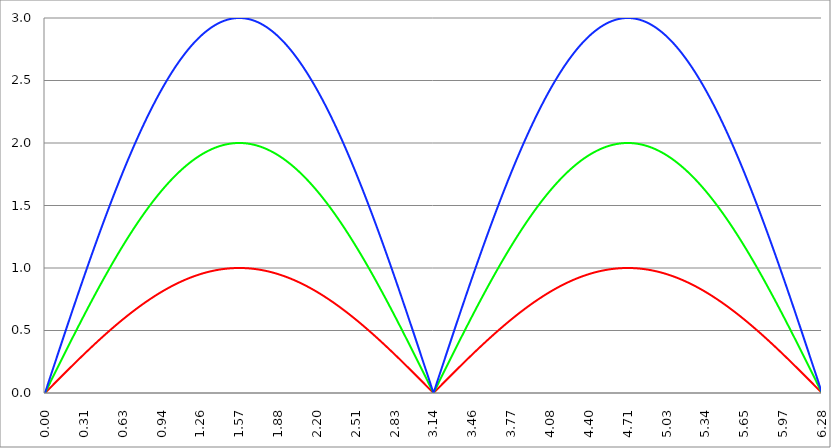
| Category | Series 1 | Series 0 | Series 2 |
|---|---|---|---|
| 0.0 | 0 | 0 | 0 |
| 0.00314159265358979 | 0.003 | 0.006 | 0.009 |
| 0.00628318530717958 | 0.006 | 0.013 | 0.019 |
| 0.00942477796076938 | 0.009 | 0.019 | 0.028 |
| 0.0125663706143592 | 0.013 | 0.025 | 0.038 |
| 0.015707963267949 | 0.016 | 0.031 | 0.047 |
| 0.0188495559215388 | 0.019 | 0.038 | 0.057 |
| 0.0219911485751285 | 0.022 | 0.044 | 0.066 |
| 0.0251327412287183 | 0.025 | 0.05 | 0.075 |
| 0.0282743338823081 | 0.028 | 0.057 | 0.085 |
| 0.0314159265358979 | 0.031 | 0.063 | 0.094 |
| 0.0345575191894877 | 0.035 | 0.069 | 0.104 |
| 0.0376991118430775 | 0.038 | 0.075 | 0.113 |
| 0.0408407044966673 | 0.041 | 0.082 | 0.122 |
| 0.0439822971502571 | 0.044 | 0.088 | 0.132 |
| 0.0471238898038469 | 0.047 | 0.094 | 0.141 |
| 0.0502654824574367 | 0.05 | 0.1 | 0.151 |
| 0.0534070751110265 | 0.053 | 0.107 | 0.16 |
| 0.0565486677646163 | 0.057 | 0.113 | 0.17 |
| 0.059690260418206 | 0.06 | 0.119 | 0.179 |
| 0.0628318530717958 | 0.063 | 0.126 | 0.188 |
| 0.0659734457253856 | 0.066 | 0.132 | 0.198 |
| 0.0691150383789754 | 0.069 | 0.138 | 0.207 |
| 0.0722566310325652 | 0.072 | 0.144 | 0.217 |
| 0.075398223686155 | 0.075 | 0.151 | 0.226 |
| 0.0785398163397448 | 0.078 | 0.157 | 0.235 |
| 0.0816814089933346 | 0.082 | 0.163 | 0.245 |
| 0.0848230016469244 | 0.085 | 0.169 | 0.254 |
| 0.0879645943005142 | 0.088 | 0.176 | 0.264 |
| 0.091106186954104 | 0.091 | 0.182 | 0.273 |
| 0.0942477796076937 | 0.094 | 0.188 | 0.282 |
| 0.0973893722612835 | 0.097 | 0.194 | 0.292 |
| 0.100530964914873 | 0.1 | 0.201 | 0.301 |
| 0.103672557568463 | 0.103 | 0.207 | 0.31 |
| 0.106814150222053 | 0.107 | 0.213 | 0.32 |
| 0.109955742875643 | 0.11 | 0.219 | 0.329 |
| 0.113097335529233 | 0.113 | 0.226 | 0.339 |
| 0.116238928182822 | 0.116 | 0.232 | 0.348 |
| 0.119380520836412 | 0.119 | 0.238 | 0.357 |
| 0.122522113490002 | 0.122 | 0.244 | 0.367 |
| 0.125663706143592 | 0.125 | 0.251 | 0.376 |
| 0.128805298797181 | 0.128 | 0.257 | 0.385 |
| 0.131946891450771 | 0.132 | 0.263 | 0.395 |
| 0.135088484104361 | 0.135 | 0.269 | 0.404 |
| 0.138230076757951 | 0.138 | 0.276 | 0.413 |
| 0.141371669411541 | 0.141 | 0.282 | 0.423 |
| 0.14451326206513 | 0.144 | 0.288 | 0.432 |
| 0.14765485471872 | 0.147 | 0.294 | 0.441 |
| 0.15079644737231 | 0.15 | 0.3 | 0.451 |
| 0.1539380400259 | 0.153 | 0.307 | 0.46 |
| 0.15707963267949 | 0.156 | 0.313 | 0.469 |
| 0.160221225333079 | 0.16 | 0.319 | 0.479 |
| 0.163362817986669 | 0.163 | 0.325 | 0.488 |
| 0.166504410640259 | 0.166 | 0.331 | 0.497 |
| 0.169646003293849 | 0.169 | 0.338 | 0.507 |
| 0.172787595947439 | 0.172 | 0.344 | 0.516 |
| 0.175929188601028 | 0.175 | 0.35 | 0.525 |
| 0.179070781254618 | 0.178 | 0.356 | 0.534 |
| 0.182212373908208 | 0.181 | 0.362 | 0.544 |
| 0.185353966561798 | 0.184 | 0.369 | 0.553 |
| 0.188495559215388 | 0.187 | 0.375 | 0.562 |
| 0.191637151868977 | 0.19 | 0.381 | 0.571 |
| 0.194778744522567 | 0.194 | 0.387 | 0.581 |
| 0.197920337176157 | 0.197 | 0.393 | 0.59 |
| 0.201061929829747 | 0.2 | 0.399 | 0.599 |
| 0.204203522483336 | 0.203 | 0.406 | 0.608 |
| 0.207345115136926 | 0.206 | 0.412 | 0.618 |
| 0.210486707790516 | 0.209 | 0.418 | 0.627 |
| 0.213628300444106 | 0.212 | 0.424 | 0.636 |
| 0.216769893097696 | 0.215 | 0.43 | 0.645 |
| 0.219911485751285 | 0.218 | 0.436 | 0.654 |
| 0.223053078404875 | 0.221 | 0.442 | 0.664 |
| 0.226194671058465 | 0.224 | 0.449 | 0.673 |
| 0.229336263712055 | 0.227 | 0.455 | 0.682 |
| 0.232477856365645 | 0.23 | 0.461 | 0.691 |
| 0.235619449019234 | 0.233 | 0.467 | 0.7 |
| 0.238761041672824 | 0.236 | 0.473 | 0.709 |
| 0.241902634326414 | 0.24 | 0.479 | 0.719 |
| 0.245044226980004 | 0.243 | 0.485 | 0.728 |
| 0.248185819633594 | 0.246 | 0.491 | 0.737 |
| 0.251327412287183 | 0.249 | 0.497 | 0.746 |
| 0.254469004940773 | 0.252 | 0.503 | 0.755 |
| 0.257610597594363 | 0.255 | 0.51 | 0.764 |
| 0.260752190247953 | 0.258 | 0.516 | 0.773 |
| 0.263893782901543 | 0.261 | 0.522 | 0.783 |
| 0.267035375555132 | 0.264 | 0.528 | 0.792 |
| 0.270176968208722 | 0.267 | 0.534 | 0.801 |
| 0.273318560862312 | 0.27 | 0.54 | 0.81 |
| 0.276460153515902 | 0.273 | 0.546 | 0.819 |
| 0.279601746169492 | 0.276 | 0.552 | 0.828 |
| 0.282743338823082 | 0.279 | 0.558 | 0.837 |
| 0.285884931476671 | 0.282 | 0.564 | 0.846 |
| 0.289026524130261 | 0.285 | 0.57 | 0.855 |
| 0.292168116783851 | 0.288 | 0.576 | 0.864 |
| 0.295309709437441 | 0.291 | 0.582 | 0.873 |
| 0.298451302091031 | 0.294 | 0.588 | 0.882 |
| 0.30159289474462 | 0.297 | 0.594 | 0.891 |
| 0.30473448739821 | 0.3 | 0.6 | 0.9 |
| 0.3078760800518 | 0.303 | 0.606 | 0.909 |
| 0.31101767270539 | 0.306 | 0.612 | 0.918 |
| 0.31415926535898 | 0.309 | 0.618 | 0.927 |
| 0.31730085801257 | 0.312 | 0.624 | 0.936 |
| 0.320442450666159 | 0.315 | 0.63 | 0.945 |
| 0.323584043319749 | 0.318 | 0.636 | 0.954 |
| 0.326725635973339 | 0.321 | 0.642 | 0.963 |
| 0.329867228626929 | 0.324 | 0.648 | 0.972 |
| 0.333008821280519 | 0.327 | 0.654 | 0.981 |
| 0.336150413934108 | 0.33 | 0.66 | 0.99 |
| 0.339292006587698 | 0.333 | 0.666 | 0.998 |
| 0.342433599241288 | 0.336 | 0.672 | 1.007 |
| 0.345575191894878 | 0.339 | 0.677 | 1.016 |
| 0.348716784548468 | 0.342 | 0.683 | 1.025 |
| 0.351858377202058 | 0.345 | 0.689 | 1.034 |
| 0.354999969855647 | 0.348 | 0.695 | 1.043 |
| 0.358141562509237 | 0.351 | 0.701 | 1.052 |
| 0.361283155162827 | 0.353 | 0.707 | 1.06 |
| 0.364424747816417 | 0.356 | 0.713 | 1.069 |
| 0.367566340470007 | 0.359 | 0.719 | 1.078 |
| 0.370707933123597 | 0.362 | 0.725 | 1.087 |
| 0.373849525777186 | 0.365 | 0.73 | 1.096 |
| 0.376991118430776 | 0.368 | 0.736 | 1.104 |
| 0.380132711084366 | 0.371 | 0.742 | 1.113 |
| 0.383274303737956 | 0.374 | 0.748 | 1.122 |
| 0.386415896391546 | 0.377 | 0.754 | 1.131 |
| 0.389557489045135 | 0.38 | 0.76 | 1.139 |
| 0.392699081698725 | 0.383 | 0.765 | 1.148 |
| 0.395840674352315 | 0.386 | 0.771 | 1.157 |
| 0.398982267005905 | 0.388 | 0.777 | 1.165 |
| 0.402123859659495 | 0.391 | 0.783 | 1.174 |
| 0.405265452313085 | 0.394 | 0.789 | 1.183 |
| 0.408407044966674 | 0.397 | 0.794 | 1.191 |
| 0.411548637620264 | 0.4 | 0.8 | 1.2 |
| 0.414690230273854 | 0.403 | 0.806 | 1.209 |
| 0.417831822927444 | 0.406 | 0.812 | 1.217 |
| 0.420973415581034 | 0.409 | 0.817 | 1.226 |
| 0.424115008234623 | 0.412 | 0.823 | 1.235 |
| 0.427256600888213 | 0.414 | 0.829 | 1.243 |
| 0.430398193541803 | 0.417 | 0.834 | 1.252 |
| 0.433539786195393 | 0.42 | 0.84 | 1.26 |
| 0.436681378848983 | 0.423 | 0.846 | 1.269 |
| 0.439822971502573 | 0.426 | 0.852 | 1.277 |
| 0.442964564156162 | 0.429 | 0.857 | 1.286 |
| 0.446106156809752 | 0.431 | 0.863 | 1.294 |
| 0.449247749463342 | 0.434 | 0.869 | 1.303 |
| 0.452389342116932 | 0.437 | 0.874 | 1.311 |
| 0.455530934770522 | 0.44 | 0.88 | 1.32 |
| 0.458672527424111 | 0.443 | 0.886 | 1.328 |
| 0.461814120077701 | 0.446 | 0.891 | 1.337 |
| 0.464955712731291 | 0.448 | 0.897 | 1.345 |
| 0.468097305384881 | 0.451 | 0.902 | 1.354 |
| 0.471238898038471 | 0.454 | 0.908 | 1.362 |
| 0.474380490692061 | 0.457 | 0.914 | 1.37 |
| 0.47752208334565 | 0.46 | 0.919 | 1.379 |
| 0.48066367599924 | 0.462 | 0.925 | 1.387 |
| 0.48380526865283 | 0.465 | 0.93 | 1.395 |
| 0.48694686130642 | 0.468 | 0.936 | 1.404 |
| 0.49008845396001 | 0.471 | 0.941 | 1.412 |
| 0.493230046613599 | 0.473 | 0.947 | 1.42 |
| 0.496371639267189 | 0.476 | 0.952 | 1.429 |
| 0.499513231920779 | 0.479 | 0.958 | 1.437 |
| 0.502654824574369 | 0.482 | 0.964 | 1.445 |
| 0.505796417227959 | 0.485 | 0.969 | 1.454 |
| 0.508938009881549 | 0.487 | 0.975 | 1.462 |
| 0.512079602535138 | 0.49 | 0.98 | 1.47 |
| 0.515221195188728 | 0.493 | 0.985 | 1.478 |
| 0.518362787842318 | 0.495 | 0.991 | 1.486 |
| 0.521504380495908 | 0.498 | 0.996 | 1.495 |
| 0.524645973149498 | 0.501 | 1.002 | 1.503 |
| 0.527787565803087 | 0.504 | 1.007 | 1.511 |
| 0.530929158456677 | 0.506 | 1.013 | 1.519 |
| 0.534070751110267 | 0.509 | 1.018 | 1.527 |
| 0.537212343763857 | 0.512 | 1.023 | 1.535 |
| 0.540353936417447 | 0.514 | 1.029 | 1.543 |
| 0.543495529071037 | 0.517 | 1.034 | 1.551 |
| 0.546637121724626 | 0.52 | 1.04 | 1.559 |
| 0.549778714378216 | 0.522 | 1.045 | 1.567 |
| 0.552920307031806 | 0.525 | 1.05 | 1.576 |
| 0.556061899685396 | 0.528 | 1.056 | 1.584 |
| 0.559203492338986 | 0.531 | 1.061 | 1.592 |
| 0.562345084992576 | 0.533 | 1.066 | 1.6 |
| 0.565486677646165 | 0.536 | 1.072 | 1.607 |
| 0.568628270299755 | 0.538 | 1.077 | 1.615 |
| 0.571769862953345 | 0.541 | 1.082 | 1.623 |
| 0.574911455606935 | 0.544 | 1.088 | 1.631 |
| 0.578053048260525 | 0.546 | 1.093 | 1.639 |
| 0.581194640914114 | 0.549 | 1.098 | 1.647 |
| 0.584336233567704 | 0.552 | 1.103 | 1.655 |
| 0.587477826221294 | 0.554 | 1.109 | 1.663 |
| 0.590619418874884 | 0.557 | 1.114 | 1.671 |
| 0.593761011528474 | 0.559 | 1.119 | 1.678 |
| 0.596902604182064 | 0.562 | 1.124 | 1.686 |
| 0.600044196835653 | 0.565 | 1.129 | 1.694 |
| 0.603185789489243 | 0.567 | 1.135 | 1.702 |
| 0.606327382142833 | 0.57 | 1.14 | 1.71 |
| 0.609468974796423 | 0.572 | 1.145 | 1.717 |
| 0.612610567450013 | 0.575 | 1.15 | 1.725 |
| 0.615752160103602 | 0.578 | 1.155 | 1.733 |
| 0.618893752757192 | 0.58 | 1.16 | 1.74 |
| 0.622035345410782 | 0.583 | 1.165 | 1.748 |
| 0.625176938064372 | 0.585 | 1.17 | 1.756 |
| 0.628318530717962 | 0.588 | 1.176 | 1.763 |
| 0.631460123371551 | 0.59 | 1.181 | 1.771 |
| 0.634601716025141 | 0.593 | 1.186 | 1.779 |
| 0.637743308678731 | 0.595 | 1.191 | 1.786 |
| 0.640884901332321 | 0.598 | 1.196 | 1.794 |
| 0.644026493985911 | 0.6 | 1.201 | 1.801 |
| 0.647168086639501 | 0.603 | 1.206 | 1.809 |
| 0.65030967929309 | 0.605 | 1.211 | 1.816 |
| 0.65345127194668 | 0.608 | 1.216 | 1.824 |
| 0.65659286460027 | 0.61 | 1.221 | 1.831 |
| 0.65973445725386 | 0.613 | 1.226 | 1.839 |
| 0.66287604990745 | 0.615 | 1.231 | 1.846 |
| 0.666017642561039 | 0.618 | 1.236 | 1.854 |
| 0.669159235214629 | 0.62 | 1.241 | 1.861 |
| 0.672300827868219 | 0.623 | 1.246 | 1.868 |
| 0.675442420521809 | 0.625 | 1.25 | 1.876 |
| 0.678584013175399 | 0.628 | 1.255 | 1.883 |
| 0.681725605828989 | 0.63 | 1.26 | 1.89 |
| 0.684867198482578 | 0.633 | 1.265 | 1.898 |
| 0.688008791136168 | 0.635 | 1.27 | 1.905 |
| 0.691150383789758 | 0.637 | 1.275 | 1.912 |
| 0.694291976443348 | 0.64 | 1.28 | 1.92 |
| 0.697433569096938 | 0.642 | 1.285 | 1.927 |
| 0.700575161750528 | 0.645 | 1.289 | 1.934 |
| 0.703716754404117 | 0.647 | 1.294 | 1.941 |
| 0.706858347057707 | 0.649 | 1.299 | 1.948 |
| 0.709999939711297 | 0.652 | 1.304 | 1.956 |
| 0.713141532364887 | 0.654 | 1.308 | 1.963 |
| 0.716283125018477 | 0.657 | 1.313 | 1.97 |
| 0.719424717672066 | 0.659 | 1.318 | 1.977 |
| 0.722566310325656 | 0.661 | 1.323 | 1.984 |
| 0.725707902979246 | 0.664 | 1.327 | 1.991 |
| 0.728849495632836 | 0.666 | 1.332 | 1.998 |
| 0.731991088286426 | 0.668 | 1.337 | 2.005 |
| 0.735132680940016 | 0.671 | 1.341 | 2.012 |
| 0.738274273593605 | 0.673 | 1.346 | 2.019 |
| 0.741415866247195 | 0.675 | 1.351 | 2.026 |
| 0.744557458900785 | 0.678 | 1.355 | 2.033 |
| 0.747699051554375 | 0.68 | 1.36 | 2.04 |
| 0.750840644207965 | 0.682 | 1.365 | 2.047 |
| 0.753982236861554 | 0.685 | 1.369 | 2.054 |
| 0.757123829515144 | 0.687 | 1.374 | 2.061 |
| 0.760265422168734 | 0.689 | 1.378 | 2.067 |
| 0.763407014822324 | 0.691 | 1.383 | 2.074 |
| 0.766548607475914 | 0.694 | 1.387 | 2.081 |
| 0.769690200129504 | 0.696 | 1.392 | 2.088 |
| 0.772831792783093 | 0.698 | 1.396 | 2.094 |
| 0.775973385436683 | 0.7 | 1.401 | 2.101 |
| 0.779114978090273 | 0.703 | 1.405 | 2.108 |
| 0.782256570743863 | 0.705 | 1.41 | 2.115 |
| 0.785398163397453 | 0.707 | 1.414 | 2.121 |
| 0.788539756051042 | 0.709 | 1.419 | 2.128 |
| 0.791681348704632 | 0.712 | 1.423 | 2.135 |
| 0.794822941358222 | 0.714 | 1.427 | 2.141 |
| 0.797964534011812 | 0.716 | 1.432 | 2.148 |
| 0.801106126665402 | 0.718 | 1.436 | 2.154 |
| 0.804247719318992 | 0.72 | 1.441 | 2.161 |
| 0.807389311972581 | 0.722 | 1.445 | 2.167 |
| 0.810530904626171 | 0.725 | 1.449 | 2.174 |
| 0.813672497279761 | 0.727 | 1.454 | 2.18 |
| 0.816814089933351 | 0.729 | 1.458 | 2.187 |
| 0.819955682586941 | 0.731 | 1.462 | 2.193 |
| 0.823097275240531 | 0.733 | 1.467 | 2.2 |
| 0.82623886789412 | 0.735 | 1.471 | 2.206 |
| 0.82938046054771 | 0.738 | 1.475 | 2.213 |
| 0.8325220532013 | 0.74 | 1.479 | 2.219 |
| 0.83566364585489 | 0.742 | 1.483 | 2.225 |
| 0.83880523850848 | 0.744 | 1.488 | 2.232 |
| 0.841946831162069 | 0.746 | 1.492 | 2.238 |
| 0.845088423815659 | 0.748 | 1.496 | 2.244 |
| 0.848230016469249 | 0.75 | 1.5 | 2.25 |
| 0.851371609122839 | 0.752 | 1.504 | 2.257 |
| 0.854513201776429 | 0.754 | 1.509 | 2.263 |
| 0.857654794430019 | 0.756 | 1.513 | 2.269 |
| 0.860796387083608 | 0.758 | 1.517 | 2.275 |
| 0.863937979737198 | 0.76 | 1.521 | 2.281 |
| 0.867079572390788 | 0.762 | 1.525 | 2.287 |
| 0.870221165044378 | 0.764 | 1.529 | 2.293 |
| 0.873362757697968 | 0.766 | 1.533 | 2.299 |
| 0.876504350351557 | 0.769 | 1.537 | 2.306 |
| 0.879645943005147 | 0.771 | 1.541 | 2.312 |
| 0.882787535658737 | 0.773 | 1.545 | 2.318 |
| 0.885929128312327 | 0.775 | 1.549 | 2.324 |
| 0.889070720965917 | 0.776 | 1.553 | 2.329 |
| 0.892212313619507 | 0.778 | 1.557 | 2.335 |
| 0.895353906273096 | 0.78 | 1.561 | 2.341 |
| 0.898495498926686 | 0.782 | 1.565 | 2.347 |
| 0.901637091580276 | 0.784 | 1.569 | 2.353 |
| 0.904778684233866 | 0.786 | 1.573 | 2.359 |
| 0.907920276887456 | 0.788 | 1.576 | 2.365 |
| 0.911061869541045 | 0.79 | 1.58 | 2.37 |
| 0.914203462194635 | 0.792 | 1.584 | 2.376 |
| 0.917345054848225 | 0.794 | 1.588 | 2.382 |
| 0.920486647501815 | 0.796 | 1.592 | 2.388 |
| 0.923628240155405 | 0.798 | 1.596 | 2.393 |
| 0.926769832808995 | 0.8 | 1.599 | 2.399 |
| 0.929911425462584 | 0.802 | 1.603 | 2.405 |
| 0.933053018116174 | 0.803 | 1.607 | 2.41 |
| 0.936194610769764 | 0.805 | 1.611 | 2.416 |
| 0.939336203423354 | 0.807 | 1.614 | 2.421 |
| 0.942477796076944 | 0.809 | 1.618 | 2.427 |
| 0.945619388730533 | 0.811 | 1.622 | 2.433 |
| 0.948760981384123 | 0.813 | 1.625 | 2.438 |
| 0.951902574037713 | 0.815 | 1.629 | 2.444 |
| 0.955044166691303 | 0.816 | 1.633 | 2.449 |
| 0.958185759344893 | 0.818 | 1.636 | 2.454 |
| 0.961327351998483 | 0.82 | 1.64 | 2.46 |
| 0.964468944652072 | 0.822 | 1.643 | 2.465 |
| 0.967610537305662 | 0.824 | 1.647 | 2.471 |
| 0.970752129959252 | 0.825 | 1.651 | 2.476 |
| 0.973893722612842 | 0.827 | 1.654 | 2.481 |
| 0.977035315266432 | 0.829 | 1.658 | 2.487 |
| 0.980176907920022 | 0.831 | 1.661 | 2.492 |
| 0.983318500573611 | 0.832 | 1.665 | 2.497 |
| 0.986460093227201 | 0.834 | 1.668 | 2.502 |
| 0.989601685880791 | 0.836 | 1.672 | 2.507 |
| 0.992743278534381 | 0.838 | 1.675 | 2.513 |
| 0.995884871187971 | 0.839 | 1.678 | 2.518 |
| 0.99902646384156 | 0.841 | 1.682 | 2.523 |
| 1.00216805649515 | 0.843 | 1.685 | 2.528 |
| 1.00530964914874 | 0.844 | 1.689 | 2.533 |
| 1.00845124180233 | 0.846 | 1.692 | 2.538 |
| 1.01159283445592 | 0.848 | 1.695 | 2.543 |
| 1.01473442710951 | 0.849 | 1.699 | 2.548 |
| 1.017876019763099 | 0.851 | 1.702 | 2.553 |
| 1.021017612416689 | 0.853 | 1.705 | 2.558 |
| 1.02415920507028 | 0.854 | 1.709 | 2.563 |
| 1.027300797723869 | 0.856 | 1.712 | 2.568 |
| 1.030442390377459 | 0.858 | 1.715 | 2.573 |
| 1.033583983031048 | 0.859 | 1.718 | 2.577 |
| 1.036725575684638 | 0.861 | 1.721 | 2.582 |
| 1.039867168338228 | 0.862 | 1.725 | 2.587 |
| 1.043008760991818 | 0.864 | 1.728 | 2.592 |
| 1.046150353645408 | 0.866 | 1.731 | 2.597 |
| 1.049291946298998 | 0.867 | 1.734 | 2.601 |
| 1.052433538952587 | 0.869 | 1.737 | 2.606 |
| 1.055575131606177 | 0.87 | 1.74 | 2.611 |
| 1.058716724259767 | 0.872 | 1.743 | 2.615 |
| 1.061858316913357 | 0.873 | 1.747 | 2.62 |
| 1.064999909566947 | 0.875 | 1.75 | 2.624 |
| 1.068141502220536 | 0.876 | 1.753 | 2.629 |
| 1.071283094874126 | 0.878 | 1.756 | 2.633 |
| 1.074424687527716 | 0.879 | 1.759 | 2.638 |
| 1.077566280181306 | 0.881 | 1.762 | 2.642 |
| 1.080707872834896 | 0.882 | 1.765 | 2.647 |
| 1.083849465488486 | 0.884 | 1.768 | 2.651 |
| 1.086991058142075 | 0.885 | 1.77 | 2.656 |
| 1.090132650795665 | 0.887 | 1.773 | 2.66 |
| 1.093274243449255 | 0.888 | 1.776 | 2.664 |
| 1.096415836102845 | 0.89 | 1.779 | 2.669 |
| 1.099557428756435 | 0.891 | 1.782 | 2.673 |
| 1.102699021410025 | 0.892 | 1.785 | 2.677 |
| 1.105840614063614 | 0.894 | 1.788 | 2.682 |
| 1.108982206717204 | 0.895 | 1.79 | 2.686 |
| 1.112123799370794 | 0.897 | 1.793 | 2.69 |
| 1.115265392024384 | 0.898 | 1.796 | 2.694 |
| 1.118406984677974 | 0.899 | 1.799 | 2.698 |
| 1.121548577331563 | 0.901 | 1.802 | 2.702 |
| 1.124690169985153 | 0.902 | 1.804 | 2.706 |
| 1.127831762638743 | 0.903 | 1.807 | 2.71 |
| 1.130973355292333 | 0.905 | 1.81 | 2.714 |
| 1.134114947945923 | 0.906 | 1.812 | 2.718 |
| 1.137256540599513 | 0.907 | 1.815 | 2.722 |
| 1.140398133253102 | 0.909 | 1.818 | 2.726 |
| 1.143539725906692 | 0.91 | 1.82 | 2.73 |
| 1.146681318560282 | 0.911 | 1.823 | 2.734 |
| 1.149822911213872 | 0.913 | 1.825 | 2.738 |
| 1.152964503867462 | 0.914 | 1.828 | 2.742 |
| 1.156106096521051 | 0.915 | 1.83 | 2.746 |
| 1.159247689174641 | 0.917 | 1.833 | 2.75 |
| 1.162389281828231 | 0.918 | 1.836 | 2.753 |
| 1.165530874481821 | 0.919 | 1.838 | 2.757 |
| 1.168672467135411 | 0.92 | 1.84 | 2.761 |
| 1.171814059789001 | 0.921 | 1.843 | 2.764 |
| 1.17495565244259 | 0.923 | 1.845 | 2.768 |
| 1.17809724509618 | 0.924 | 1.848 | 2.772 |
| 1.18123883774977 | 0.925 | 1.85 | 2.775 |
| 1.18438043040336 | 0.926 | 1.853 | 2.779 |
| 1.18752202305695 | 0.927 | 1.855 | 2.782 |
| 1.190663615710539 | 0.929 | 1.857 | 2.786 |
| 1.193805208364129 | 0.93 | 1.86 | 2.789 |
| 1.19694680101772 | 0.931 | 1.862 | 2.793 |
| 1.200088393671309 | 0.932 | 1.864 | 2.796 |
| 1.203229986324899 | 0.933 | 1.866 | 2.8 |
| 1.206371578978489 | 0.934 | 1.869 | 2.803 |
| 1.209513171632078 | 0.935 | 1.871 | 2.806 |
| 1.212654764285668 | 0.937 | 1.873 | 2.81 |
| 1.215796356939258 | 0.938 | 1.875 | 2.813 |
| 1.218937949592848 | 0.939 | 1.877 | 2.816 |
| 1.222079542246438 | 0.94 | 1.88 | 2.819 |
| 1.225221134900027 | 0.941 | 1.882 | 2.823 |
| 1.228362727553617 | 0.942 | 1.884 | 2.826 |
| 1.231504320207207 | 0.943 | 1.886 | 2.829 |
| 1.234645912860797 | 0.944 | 1.888 | 2.832 |
| 1.237787505514387 | 0.945 | 1.89 | 2.835 |
| 1.240929098167977 | 0.946 | 1.892 | 2.838 |
| 1.244070690821566 | 0.947 | 1.894 | 2.841 |
| 1.247212283475156 | 0.948 | 1.896 | 2.844 |
| 1.250353876128746 | 0.949 | 1.898 | 2.847 |
| 1.253495468782336 | 0.95 | 1.9 | 2.85 |
| 1.256637061435926 | 0.951 | 1.902 | 2.853 |
| 1.259778654089515 | 0.952 | 1.904 | 2.856 |
| 1.262920246743105 | 0.953 | 1.906 | 2.859 |
| 1.266061839396695 | 0.954 | 1.908 | 2.862 |
| 1.269203432050285 | 0.955 | 1.91 | 2.865 |
| 1.272345024703875 | 0.956 | 1.912 | 2.867 |
| 1.275486617357465 | 0.957 | 1.913 | 2.87 |
| 1.278628210011054 | 0.958 | 1.915 | 2.873 |
| 1.281769802664644 | 0.959 | 1.917 | 2.876 |
| 1.284911395318234 | 0.959 | 1.919 | 2.878 |
| 1.288052987971824 | 0.96 | 1.921 | 2.881 |
| 1.291194580625414 | 0.961 | 1.922 | 2.883 |
| 1.294336173279003 | 0.962 | 1.924 | 2.886 |
| 1.297477765932593 | 0.963 | 1.926 | 2.889 |
| 1.300619358586183 | 0.964 | 1.927 | 2.891 |
| 1.303760951239773 | 0.965 | 1.929 | 2.894 |
| 1.306902543893363 | 0.965 | 1.931 | 2.896 |
| 1.310044136546953 | 0.966 | 1.932 | 2.899 |
| 1.313185729200542 | 0.967 | 1.934 | 2.901 |
| 1.316327321854132 | 0.968 | 1.936 | 2.903 |
| 1.319468914507722 | 0.969 | 1.937 | 2.906 |
| 1.322610507161312 | 0.969 | 1.939 | 2.908 |
| 1.325752099814902 | 0.97 | 1.94 | 2.91 |
| 1.328893692468491 | 0.971 | 1.942 | 2.913 |
| 1.332035285122081 | 0.972 | 1.943 | 2.915 |
| 1.335176877775671 | 0.972 | 1.945 | 2.917 |
| 1.338318470429261 | 0.973 | 1.946 | 2.919 |
| 1.341460063082851 | 0.974 | 1.948 | 2.921 |
| 1.344601655736441 | 0.975 | 1.949 | 2.924 |
| 1.34774324839003 | 0.975 | 1.95 | 2.926 |
| 1.35088484104362 | 0.976 | 1.952 | 2.928 |
| 1.35402643369721 | 0.977 | 1.953 | 2.93 |
| 1.3571680263508 | 0.977 | 1.955 | 2.932 |
| 1.36030961900439 | 0.978 | 1.956 | 2.934 |
| 1.363451211657979 | 0.979 | 1.957 | 2.936 |
| 1.36659280431157 | 0.979 | 1.958 | 2.938 |
| 1.369734396965159 | 0.98 | 1.96 | 2.94 |
| 1.372875989618749 | 0.98 | 1.961 | 2.941 |
| 1.376017582272339 | 0.981 | 1.962 | 2.943 |
| 1.379159174925929 | 0.982 | 1.963 | 2.945 |
| 1.382300767579518 | 0.982 | 1.965 | 2.947 |
| 1.385442360233108 | 0.983 | 1.966 | 2.949 |
| 1.388583952886698 | 0.983 | 1.967 | 2.95 |
| 1.391725545540288 | 0.984 | 1.968 | 2.952 |
| 1.394867138193878 | 0.985 | 1.969 | 2.954 |
| 1.398008730847468 | 0.985 | 1.97 | 2.955 |
| 1.401150323501057 | 0.986 | 1.971 | 2.957 |
| 1.404291916154647 | 0.986 | 1.972 | 2.959 |
| 1.407433508808237 | 0.987 | 1.973 | 2.96 |
| 1.410575101461827 | 0.987 | 1.974 | 2.962 |
| 1.413716694115417 | 0.988 | 1.975 | 2.963 |
| 1.416858286769006 | 0.988 | 1.976 | 2.965 |
| 1.419999879422596 | 0.989 | 1.977 | 2.966 |
| 1.423141472076186 | 0.989 | 1.978 | 2.967 |
| 1.426283064729776 | 0.99 | 1.979 | 2.969 |
| 1.429424657383366 | 0.99 | 1.98 | 2.97 |
| 1.432566250036956 | 0.99 | 1.981 | 2.971 |
| 1.435707842690545 | 0.991 | 1.982 | 2.973 |
| 1.438849435344135 | 0.991 | 1.983 | 2.974 |
| 1.441991027997725 | 0.992 | 1.983 | 2.975 |
| 1.445132620651315 | 0.992 | 1.984 | 2.976 |
| 1.448274213304905 | 0.993 | 1.985 | 2.978 |
| 1.451415805958494 | 0.993 | 1.986 | 2.979 |
| 1.454557398612084 | 0.993 | 1.987 | 2.98 |
| 1.457698991265674 | 0.994 | 1.987 | 2.981 |
| 1.460840583919264 | 0.994 | 1.988 | 2.982 |
| 1.463982176572854 | 0.994 | 1.989 | 2.983 |
| 1.467123769226444 | 0.995 | 1.989 | 2.984 |
| 1.470265361880033 | 0.995 | 1.99 | 2.985 |
| 1.473406954533623 | 0.995 | 1.991 | 2.986 |
| 1.476548547187213 | 0.996 | 1.991 | 2.987 |
| 1.479690139840803 | 0.996 | 1.992 | 2.988 |
| 1.482831732494393 | 0.996 | 1.992 | 2.988 |
| 1.485973325147982 | 0.996 | 1.993 | 2.989 |
| 1.489114917801572 | 0.997 | 1.993 | 2.99 |
| 1.492256510455162 | 0.997 | 1.994 | 2.991 |
| 1.495398103108752 | 0.997 | 1.994 | 2.991 |
| 1.498539695762342 | 0.997 | 1.995 | 2.992 |
| 1.501681288415932 | 0.998 | 1.995 | 2.993 |
| 1.504822881069521 | 0.998 | 1.996 | 2.993 |
| 1.507964473723111 | 0.998 | 1.996 | 2.994 |
| 1.511106066376701 | 0.998 | 1.996 | 2.995 |
| 1.514247659030291 | 0.998 | 1.997 | 2.995 |
| 1.517389251683881 | 0.999 | 1.997 | 2.996 |
| 1.520530844337471 | 0.999 | 1.997 | 2.996 |
| 1.52367243699106 | 0.999 | 1.998 | 2.997 |
| 1.52681402964465 | 0.999 | 1.998 | 2.997 |
| 1.52995562229824 | 0.999 | 1.998 | 2.997 |
| 1.53309721495183 | 0.999 | 1.999 | 2.998 |
| 1.53623880760542 | 0.999 | 1.999 | 2.998 |
| 1.539380400259009 | 1 | 1.999 | 2.999 |
| 1.542521992912599 | 1 | 1.999 | 2.999 |
| 1.545663585566189 | 1 | 1.999 | 2.999 |
| 1.548805178219779 | 1 | 2 | 2.999 |
| 1.551946770873369 | 1 | 2 | 2.999 |
| 1.555088363526959 | 1 | 2 | 3 |
| 1.558229956180548 | 1 | 2 | 3 |
| 1.561371548834138 | 1 | 2 | 3 |
| 1.564513141487728 | 1 | 2 | 3 |
| 1.567654734141318 | 1 | 2 | 3 |
| 1.570796326794908 | 1 | 2 | 3 |
| 1.573937919448497 | 1 | 2 | 3 |
| 1.577079512102087 | 1 | 2 | 3 |
| 1.580221104755677 | 1 | 2 | 3 |
| 1.583362697409267 | 1 | 2 | 3 |
| 1.586504290062857 | 1 | 2 | 3 |
| 1.589645882716447 | 1 | 2 | 2.999 |
| 1.592787475370036 | 1 | 2 | 2.999 |
| 1.595929068023626 | 1 | 1.999 | 2.999 |
| 1.599070660677216 | 1 | 1.999 | 2.999 |
| 1.602212253330806 | 1 | 1.999 | 2.999 |
| 1.605353845984396 | 0.999 | 1.999 | 2.998 |
| 1.608495438637985 | 0.999 | 1.999 | 2.998 |
| 1.611637031291575 | 0.999 | 1.998 | 2.997 |
| 1.614778623945165 | 0.999 | 1.998 | 2.997 |
| 1.617920216598755 | 0.999 | 1.998 | 2.997 |
| 1.621061809252345 | 0.999 | 1.997 | 2.996 |
| 1.624203401905935 | 0.999 | 1.997 | 2.996 |
| 1.627344994559524 | 0.998 | 1.997 | 2.995 |
| 1.630486587213114 | 0.998 | 1.996 | 2.995 |
| 1.633628179866704 | 0.998 | 1.996 | 2.994 |
| 1.636769772520294 | 0.998 | 1.996 | 2.993 |
| 1.639911365173884 | 0.998 | 1.995 | 2.993 |
| 1.643052957827473 | 0.997 | 1.995 | 2.992 |
| 1.646194550481063 | 0.997 | 1.994 | 2.991 |
| 1.649336143134653 | 0.997 | 1.994 | 2.991 |
| 1.652477735788243 | 0.997 | 1.993 | 2.99 |
| 1.655619328441833 | 0.996 | 1.993 | 2.989 |
| 1.658760921095423 | 0.996 | 1.992 | 2.988 |
| 1.661902513749012 | 0.996 | 1.992 | 2.988 |
| 1.665044106402602 | 0.996 | 1.991 | 2.987 |
| 1.668185699056192 | 0.995 | 1.991 | 2.986 |
| 1.671327291709782 | 0.995 | 1.99 | 2.985 |
| 1.674468884363372 | 0.995 | 1.989 | 2.984 |
| 1.677610477016961 | 0.994 | 1.989 | 2.983 |
| 1.680752069670551 | 0.994 | 1.988 | 2.982 |
| 1.683893662324141 | 0.994 | 1.987 | 2.981 |
| 1.687035254977731 | 0.993 | 1.987 | 2.98 |
| 1.690176847631321 | 0.993 | 1.986 | 2.979 |
| 1.693318440284911 | 0.993 | 1.985 | 2.978 |
| 1.6964600329385 | 0.992 | 1.984 | 2.976 |
| 1.69960162559209 | 0.992 | 1.983 | 2.975 |
| 1.70274321824568 | 0.991 | 1.983 | 2.974 |
| 1.70588481089927 | 0.991 | 1.982 | 2.973 |
| 1.70902640355286 | 0.99 | 1.981 | 2.971 |
| 1.712167996206449 | 0.99 | 1.98 | 2.97 |
| 1.715309588860039 | 0.99 | 1.979 | 2.969 |
| 1.71845118151363 | 0.989 | 1.978 | 2.967 |
| 1.721592774167219 | 0.989 | 1.977 | 2.966 |
| 1.724734366820809 | 0.988 | 1.976 | 2.965 |
| 1.727875959474399 | 0.988 | 1.975 | 2.963 |
| 1.731017552127988 | 0.987 | 1.974 | 2.962 |
| 1.734159144781578 | 0.987 | 1.973 | 2.96 |
| 1.737300737435168 | 0.986 | 1.972 | 2.959 |
| 1.740442330088758 | 0.986 | 1.971 | 2.957 |
| 1.743583922742348 | 0.985 | 1.97 | 2.955 |
| 1.746725515395937 | 0.985 | 1.969 | 2.954 |
| 1.749867108049527 | 0.984 | 1.968 | 2.952 |
| 1.753008700703117 | 0.983 | 1.967 | 2.95 |
| 1.756150293356707 | 0.983 | 1.966 | 2.949 |
| 1.759291886010297 | 0.982 | 1.965 | 2.947 |
| 1.762433478663887 | 0.982 | 1.963 | 2.945 |
| 1.765575071317476 | 0.981 | 1.962 | 2.943 |
| 1.768716663971066 | 0.98 | 1.961 | 2.941 |
| 1.771858256624656 | 0.98 | 1.96 | 2.94 |
| 1.774999849278246 | 0.979 | 1.958 | 2.938 |
| 1.778141441931836 | 0.979 | 1.957 | 2.936 |
| 1.781283034585426 | 0.978 | 1.956 | 2.934 |
| 1.784424627239015 | 0.977 | 1.955 | 2.932 |
| 1.787566219892605 | 0.977 | 1.953 | 2.93 |
| 1.790707812546195 | 0.976 | 1.952 | 2.928 |
| 1.793849405199785 | 0.975 | 1.95 | 2.926 |
| 1.796990997853375 | 0.975 | 1.949 | 2.924 |
| 1.800132590506964 | 0.974 | 1.948 | 2.921 |
| 1.803274183160554 | 0.973 | 1.946 | 2.919 |
| 1.806415775814144 | 0.972 | 1.945 | 2.917 |
| 1.809557368467734 | 0.972 | 1.943 | 2.915 |
| 1.812698961121324 | 0.971 | 1.942 | 2.913 |
| 1.815840553774914 | 0.97 | 1.94 | 2.91 |
| 1.818982146428503 | 0.969 | 1.939 | 2.908 |
| 1.822123739082093 | 0.969 | 1.937 | 2.906 |
| 1.825265331735683 | 0.968 | 1.936 | 2.903 |
| 1.828406924389273 | 0.967 | 1.934 | 2.901 |
| 1.831548517042863 | 0.966 | 1.932 | 2.899 |
| 1.834690109696452 | 0.965 | 1.931 | 2.896 |
| 1.837831702350042 | 0.965 | 1.929 | 2.894 |
| 1.840973295003632 | 0.964 | 1.927 | 2.891 |
| 1.844114887657222 | 0.963 | 1.926 | 2.889 |
| 1.847256480310812 | 0.962 | 1.924 | 2.886 |
| 1.850398072964402 | 0.961 | 1.922 | 2.883 |
| 1.853539665617991 | 0.96 | 1.921 | 2.881 |
| 1.856681258271581 | 0.959 | 1.919 | 2.878 |
| 1.859822850925171 | 0.959 | 1.917 | 2.876 |
| 1.862964443578761 | 0.958 | 1.915 | 2.873 |
| 1.866106036232351 | 0.957 | 1.913 | 2.87 |
| 1.86924762888594 | 0.956 | 1.912 | 2.867 |
| 1.87238922153953 | 0.955 | 1.91 | 2.865 |
| 1.87553081419312 | 0.954 | 1.908 | 2.862 |
| 1.87867240684671 | 0.953 | 1.906 | 2.859 |
| 1.8818139995003 | 0.952 | 1.904 | 2.856 |
| 1.88495559215389 | 0.951 | 1.902 | 2.853 |
| 1.888097184807479 | 0.95 | 1.9 | 2.85 |
| 1.891238777461069 | 0.949 | 1.898 | 2.847 |
| 1.89438037011466 | 0.948 | 1.896 | 2.844 |
| 1.897521962768249 | 0.947 | 1.894 | 2.841 |
| 1.900663555421839 | 0.946 | 1.892 | 2.838 |
| 1.903805148075429 | 0.945 | 1.89 | 2.835 |
| 1.906946740729018 | 0.944 | 1.888 | 2.832 |
| 1.910088333382608 | 0.943 | 1.886 | 2.829 |
| 1.913229926036198 | 0.942 | 1.884 | 2.826 |
| 1.916371518689788 | 0.941 | 1.882 | 2.823 |
| 1.919513111343378 | 0.94 | 1.88 | 2.819 |
| 1.922654703996967 | 0.939 | 1.877 | 2.816 |
| 1.925796296650557 | 0.938 | 1.875 | 2.813 |
| 1.928937889304147 | 0.937 | 1.873 | 2.81 |
| 1.932079481957737 | 0.935 | 1.871 | 2.806 |
| 1.935221074611327 | 0.934 | 1.869 | 2.803 |
| 1.938362667264917 | 0.933 | 1.866 | 2.8 |
| 1.941504259918506 | 0.932 | 1.864 | 2.796 |
| 1.944645852572096 | 0.931 | 1.862 | 2.793 |
| 1.947787445225686 | 0.93 | 1.86 | 2.789 |
| 1.950929037879276 | 0.929 | 1.857 | 2.786 |
| 1.954070630532866 | 0.927 | 1.855 | 2.782 |
| 1.957212223186455 | 0.926 | 1.853 | 2.779 |
| 1.960353815840045 | 0.925 | 1.85 | 2.775 |
| 1.963495408493635 | 0.924 | 1.848 | 2.772 |
| 1.966637001147225 | 0.923 | 1.845 | 2.768 |
| 1.969778593800815 | 0.921 | 1.843 | 2.764 |
| 1.972920186454405 | 0.92 | 1.84 | 2.761 |
| 1.976061779107994 | 0.919 | 1.838 | 2.757 |
| 1.979203371761584 | 0.918 | 1.836 | 2.753 |
| 1.982344964415174 | 0.917 | 1.833 | 2.75 |
| 1.985486557068764 | 0.915 | 1.83 | 2.746 |
| 1.988628149722354 | 0.914 | 1.828 | 2.742 |
| 1.991769742375943 | 0.913 | 1.825 | 2.738 |
| 1.994911335029533 | 0.911 | 1.823 | 2.734 |
| 1.998052927683123 | 0.91 | 1.82 | 2.73 |
| 2.001194520336712 | 0.909 | 1.818 | 2.726 |
| 2.004336112990302 | 0.907 | 1.815 | 2.722 |
| 2.007477705643892 | 0.906 | 1.812 | 2.718 |
| 2.010619298297482 | 0.905 | 1.81 | 2.714 |
| 2.013760890951071 | 0.903 | 1.807 | 2.71 |
| 2.016902483604661 | 0.902 | 1.804 | 2.706 |
| 2.02004407625825 | 0.901 | 1.802 | 2.702 |
| 2.02318566891184 | 0.899 | 1.799 | 2.698 |
| 2.02632726156543 | 0.898 | 1.796 | 2.694 |
| 2.029468854219019 | 0.897 | 1.793 | 2.69 |
| 2.032610446872609 | 0.895 | 1.79 | 2.686 |
| 2.035752039526198 | 0.894 | 1.788 | 2.682 |
| 2.038893632179788 | 0.892 | 1.785 | 2.677 |
| 2.042035224833378 | 0.891 | 1.782 | 2.673 |
| 2.045176817486967 | 0.89 | 1.779 | 2.669 |
| 2.048318410140557 | 0.888 | 1.776 | 2.664 |
| 2.051460002794146 | 0.887 | 1.773 | 2.66 |
| 2.054601595447736 | 0.885 | 1.77 | 2.656 |
| 2.057743188101325 | 0.884 | 1.768 | 2.651 |
| 2.060884780754915 | 0.882 | 1.765 | 2.647 |
| 2.064026373408505 | 0.881 | 1.762 | 2.642 |
| 2.067167966062094 | 0.879 | 1.759 | 2.638 |
| 2.070309558715684 | 0.878 | 1.756 | 2.633 |
| 2.073451151369273 | 0.876 | 1.753 | 2.629 |
| 2.076592744022863 | 0.875 | 1.75 | 2.624 |
| 2.079734336676452 | 0.873 | 1.747 | 2.62 |
| 2.082875929330042 | 0.872 | 1.743 | 2.615 |
| 2.086017521983632 | 0.87 | 1.74 | 2.611 |
| 2.089159114637221 | 0.869 | 1.737 | 2.606 |
| 2.092300707290811 | 0.867 | 1.734 | 2.601 |
| 2.095442299944401 | 0.866 | 1.731 | 2.597 |
| 2.09858389259799 | 0.864 | 1.728 | 2.592 |
| 2.10172548525158 | 0.862 | 1.725 | 2.587 |
| 2.104867077905169 | 0.861 | 1.721 | 2.582 |
| 2.108008670558759 | 0.859 | 1.718 | 2.577 |
| 2.111150263212349 | 0.858 | 1.715 | 2.573 |
| 2.114291855865938 | 0.856 | 1.712 | 2.568 |
| 2.117433448519528 | 0.854 | 1.709 | 2.563 |
| 2.120575041173117 | 0.853 | 1.705 | 2.558 |
| 2.123716633826707 | 0.851 | 1.702 | 2.553 |
| 2.126858226480297 | 0.849 | 1.699 | 2.548 |
| 2.129999819133886 | 0.848 | 1.695 | 2.543 |
| 2.133141411787476 | 0.846 | 1.692 | 2.538 |
| 2.136283004441065 | 0.844 | 1.689 | 2.533 |
| 2.139424597094655 | 0.843 | 1.685 | 2.528 |
| 2.142566189748245 | 0.841 | 1.682 | 2.523 |
| 2.145707782401834 | 0.839 | 1.678 | 2.518 |
| 2.148849375055424 | 0.838 | 1.675 | 2.513 |
| 2.151990967709013 | 0.836 | 1.672 | 2.507 |
| 2.155132560362603 | 0.834 | 1.668 | 2.502 |
| 2.158274153016193 | 0.832 | 1.665 | 2.497 |
| 2.161415745669782 | 0.831 | 1.661 | 2.492 |
| 2.164557338323372 | 0.829 | 1.658 | 2.487 |
| 2.167698930976961 | 0.827 | 1.654 | 2.481 |
| 2.170840523630551 | 0.825 | 1.651 | 2.476 |
| 2.173982116284141 | 0.824 | 1.647 | 2.471 |
| 2.17712370893773 | 0.822 | 1.643 | 2.465 |
| 2.18026530159132 | 0.82 | 1.64 | 2.46 |
| 2.183406894244909 | 0.818 | 1.636 | 2.454 |
| 2.186548486898499 | 0.816 | 1.633 | 2.449 |
| 2.189690079552089 | 0.815 | 1.629 | 2.444 |
| 2.192831672205678 | 0.813 | 1.625 | 2.438 |
| 2.195973264859268 | 0.811 | 1.622 | 2.433 |
| 2.199114857512857 | 0.809 | 1.618 | 2.427 |
| 2.202256450166447 | 0.807 | 1.614 | 2.421 |
| 2.205398042820036 | 0.805 | 1.611 | 2.416 |
| 2.208539635473626 | 0.803 | 1.607 | 2.41 |
| 2.211681228127216 | 0.802 | 1.603 | 2.405 |
| 2.214822820780805 | 0.8 | 1.599 | 2.399 |
| 2.217964413434395 | 0.798 | 1.596 | 2.393 |
| 2.221106006087984 | 0.796 | 1.592 | 2.388 |
| 2.224247598741574 | 0.794 | 1.588 | 2.382 |
| 2.227389191395164 | 0.792 | 1.584 | 2.376 |
| 2.230530784048753 | 0.79 | 1.58 | 2.37 |
| 2.233672376702343 | 0.788 | 1.576 | 2.365 |
| 2.236813969355933 | 0.786 | 1.573 | 2.359 |
| 2.239955562009522 | 0.784 | 1.569 | 2.353 |
| 2.243097154663112 | 0.782 | 1.565 | 2.347 |
| 2.246238747316701 | 0.78 | 1.561 | 2.341 |
| 2.249380339970291 | 0.778 | 1.557 | 2.335 |
| 2.252521932623881 | 0.776 | 1.553 | 2.329 |
| 2.25566352527747 | 0.775 | 1.549 | 2.324 |
| 2.25880511793106 | 0.773 | 1.545 | 2.318 |
| 2.261946710584649 | 0.771 | 1.541 | 2.312 |
| 2.265088303238239 | 0.769 | 1.537 | 2.306 |
| 2.268229895891829 | 0.766 | 1.533 | 2.299 |
| 2.271371488545418 | 0.764 | 1.529 | 2.293 |
| 2.274513081199008 | 0.762 | 1.525 | 2.287 |
| 2.277654673852597 | 0.76 | 1.521 | 2.281 |
| 2.280796266506186 | 0.758 | 1.517 | 2.275 |
| 2.283937859159776 | 0.756 | 1.513 | 2.269 |
| 2.287079451813366 | 0.754 | 1.509 | 2.263 |
| 2.290221044466955 | 0.752 | 1.504 | 2.257 |
| 2.293362637120545 | 0.75 | 1.5 | 2.25 |
| 2.296504229774135 | 0.748 | 1.496 | 2.244 |
| 2.299645822427724 | 0.746 | 1.492 | 2.238 |
| 2.302787415081314 | 0.744 | 1.488 | 2.232 |
| 2.305929007734904 | 0.742 | 1.483 | 2.225 |
| 2.309070600388493 | 0.74 | 1.479 | 2.219 |
| 2.312212193042083 | 0.738 | 1.475 | 2.213 |
| 2.315353785695672 | 0.735 | 1.471 | 2.206 |
| 2.318495378349262 | 0.733 | 1.467 | 2.2 |
| 2.321636971002852 | 0.731 | 1.462 | 2.193 |
| 2.324778563656441 | 0.729 | 1.458 | 2.187 |
| 2.327920156310031 | 0.727 | 1.454 | 2.18 |
| 2.33106174896362 | 0.725 | 1.449 | 2.174 |
| 2.33420334161721 | 0.722 | 1.445 | 2.167 |
| 2.3373449342708 | 0.72 | 1.441 | 2.161 |
| 2.340486526924389 | 0.718 | 1.436 | 2.154 |
| 2.343628119577979 | 0.716 | 1.432 | 2.148 |
| 2.346769712231568 | 0.714 | 1.427 | 2.141 |
| 2.349911304885158 | 0.712 | 1.423 | 2.135 |
| 2.353052897538748 | 0.709 | 1.419 | 2.128 |
| 2.356194490192337 | 0.707 | 1.414 | 2.121 |
| 2.359336082845927 | 0.705 | 1.41 | 2.115 |
| 2.362477675499516 | 0.703 | 1.405 | 2.108 |
| 2.365619268153106 | 0.7 | 1.401 | 2.101 |
| 2.368760860806696 | 0.698 | 1.396 | 2.094 |
| 2.371902453460285 | 0.696 | 1.392 | 2.088 |
| 2.375044046113875 | 0.694 | 1.387 | 2.081 |
| 2.378185638767464 | 0.691 | 1.383 | 2.074 |
| 2.381327231421054 | 0.689 | 1.378 | 2.067 |
| 2.384468824074644 | 0.687 | 1.374 | 2.061 |
| 2.387610416728233 | 0.685 | 1.369 | 2.054 |
| 2.390752009381823 | 0.682 | 1.365 | 2.047 |
| 2.393893602035412 | 0.68 | 1.36 | 2.04 |
| 2.397035194689002 | 0.678 | 1.355 | 2.033 |
| 2.400176787342591 | 0.675 | 1.351 | 2.026 |
| 2.403318379996181 | 0.673 | 1.346 | 2.019 |
| 2.406459972649771 | 0.671 | 1.341 | 2.012 |
| 2.40960156530336 | 0.668 | 1.337 | 2.005 |
| 2.41274315795695 | 0.666 | 1.332 | 1.998 |
| 2.41588475061054 | 0.664 | 1.327 | 1.991 |
| 2.419026343264129 | 0.661 | 1.323 | 1.984 |
| 2.422167935917719 | 0.659 | 1.318 | 1.977 |
| 2.425309528571308 | 0.657 | 1.313 | 1.97 |
| 2.428451121224898 | 0.654 | 1.308 | 1.963 |
| 2.431592713878488 | 0.652 | 1.304 | 1.956 |
| 2.434734306532077 | 0.649 | 1.299 | 1.948 |
| 2.437875899185667 | 0.647 | 1.294 | 1.941 |
| 2.441017491839256 | 0.645 | 1.289 | 1.934 |
| 2.444159084492846 | 0.642 | 1.285 | 1.927 |
| 2.447300677146435 | 0.64 | 1.28 | 1.92 |
| 2.450442269800025 | 0.637 | 1.275 | 1.912 |
| 2.453583862453615 | 0.635 | 1.27 | 1.905 |
| 2.456725455107204 | 0.633 | 1.265 | 1.898 |
| 2.459867047760794 | 0.63 | 1.26 | 1.89 |
| 2.463008640414384 | 0.628 | 1.255 | 1.883 |
| 2.466150233067973 | 0.625 | 1.25 | 1.876 |
| 2.469291825721563 | 0.623 | 1.246 | 1.868 |
| 2.472433418375152 | 0.62 | 1.241 | 1.861 |
| 2.475575011028742 | 0.618 | 1.236 | 1.854 |
| 2.478716603682332 | 0.615 | 1.231 | 1.846 |
| 2.481858196335921 | 0.613 | 1.226 | 1.839 |
| 2.48499978898951 | 0.61 | 1.221 | 1.831 |
| 2.4881413816431 | 0.608 | 1.216 | 1.824 |
| 2.49128297429669 | 0.605 | 1.211 | 1.816 |
| 2.49442456695028 | 0.603 | 1.206 | 1.809 |
| 2.497566159603869 | 0.6 | 1.201 | 1.801 |
| 2.500707752257458 | 0.598 | 1.196 | 1.794 |
| 2.503849344911048 | 0.595 | 1.191 | 1.786 |
| 2.506990937564638 | 0.593 | 1.186 | 1.779 |
| 2.510132530218228 | 0.59 | 1.181 | 1.771 |
| 2.513274122871817 | 0.588 | 1.176 | 1.763 |
| 2.516415715525407 | 0.585 | 1.17 | 1.756 |
| 2.519557308178996 | 0.583 | 1.165 | 1.748 |
| 2.522698900832586 | 0.58 | 1.16 | 1.74 |
| 2.525840493486176 | 0.578 | 1.155 | 1.733 |
| 2.528982086139765 | 0.575 | 1.15 | 1.725 |
| 2.532123678793355 | 0.572 | 1.145 | 1.717 |
| 2.535265271446944 | 0.57 | 1.14 | 1.71 |
| 2.538406864100534 | 0.567 | 1.135 | 1.702 |
| 2.541548456754124 | 0.565 | 1.129 | 1.694 |
| 2.544690049407713 | 0.562 | 1.124 | 1.686 |
| 2.547831642061302 | 0.559 | 1.119 | 1.678 |
| 2.550973234714892 | 0.557 | 1.114 | 1.671 |
| 2.554114827368482 | 0.554 | 1.109 | 1.663 |
| 2.557256420022072 | 0.552 | 1.103 | 1.655 |
| 2.560398012675661 | 0.549 | 1.098 | 1.647 |
| 2.563539605329251 | 0.546 | 1.093 | 1.639 |
| 2.56668119798284 | 0.544 | 1.088 | 1.631 |
| 2.56982279063643 | 0.541 | 1.082 | 1.623 |
| 2.57296438329002 | 0.538 | 1.077 | 1.615 |
| 2.576105975943609 | 0.536 | 1.072 | 1.607 |
| 2.579247568597199 | 0.533 | 1.066 | 1.6 |
| 2.582389161250788 | 0.531 | 1.061 | 1.592 |
| 2.585530753904377 | 0.528 | 1.056 | 1.584 |
| 2.588672346557967 | 0.525 | 1.05 | 1.576 |
| 2.591813939211557 | 0.522 | 1.045 | 1.567 |
| 2.594955531865147 | 0.52 | 1.04 | 1.559 |
| 2.598097124518736 | 0.517 | 1.034 | 1.551 |
| 2.601238717172326 | 0.514 | 1.029 | 1.543 |
| 2.604380309825915 | 0.512 | 1.023 | 1.535 |
| 2.607521902479505 | 0.509 | 1.018 | 1.527 |
| 2.610663495133095 | 0.506 | 1.013 | 1.519 |
| 2.613805087786684 | 0.504 | 1.007 | 1.511 |
| 2.616946680440274 | 0.501 | 1.002 | 1.503 |
| 2.620088273093863 | 0.498 | 0.996 | 1.495 |
| 2.623229865747452 | 0.495 | 0.991 | 1.486 |
| 2.626371458401042 | 0.493 | 0.985 | 1.478 |
| 2.629513051054632 | 0.49 | 0.98 | 1.47 |
| 2.632654643708222 | 0.487 | 0.975 | 1.462 |
| 2.635796236361811 | 0.485 | 0.969 | 1.454 |
| 2.638937829015401 | 0.482 | 0.964 | 1.445 |
| 2.642079421668991 | 0.479 | 0.958 | 1.437 |
| 2.64522101432258 | 0.476 | 0.952 | 1.429 |
| 2.64836260697617 | 0.473 | 0.947 | 1.42 |
| 2.651504199629759 | 0.471 | 0.941 | 1.412 |
| 2.654645792283349 | 0.468 | 0.936 | 1.404 |
| 2.657787384936938 | 0.465 | 0.93 | 1.395 |
| 2.660928977590528 | 0.462 | 0.925 | 1.387 |
| 2.664070570244118 | 0.46 | 0.919 | 1.379 |
| 2.667212162897707 | 0.457 | 0.914 | 1.37 |
| 2.670353755551297 | 0.454 | 0.908 | 1.362 |
| 2.673495348204887 | 0.451 | 0.902 | 1.354 |
| 2.676636940858476 | 0.448 | 0.897 | 1.345 |
| 2.679778533512066 | 0.446 | 0.891 | 1.337 |
| 2.682920126165655 | 0.443 | 0.886 | 1.328 |
| 2.686061718819245 | 0.44 | 0.88 | 1.32 |
| 2.689203311472835 | 0.437 | 0.874 | 1.311 |
| 2.692344904126424 | 0.434 | 0.869 | 1.303 |
| 2.695486496780014 | 0.431 | 0.863 | 1.294 |
| 2.698628089433603 | 0.429 | 0.857 | 1.286 |
| 2.701769682087193 | 0.426 | 0.852 | 1.277 |
| 2.704911274740782 | 0.423 | 0.846 | 1.269 |
| 2.708052867394372 | 0.42 | 0.84 | 1.26 |
| 2.711194460047962 | 0.417 | 0.834 | 1.252 |
| 2.714336052701551 | 0.414 | 0.829 | 1.243 |
| 2.717477645355141 | 0.412 | 0.823 | 1.235 |
| 2.720619238008731 | 0.409 | 0.817 | 1.226 |
| 2.72376083066232 | 0.406 | 0.812 | 1.217 |
| 2.72690242331591 | 0.403 | 0.806 | 1.209 |
| 2.730044015969499 | 0.4 | 0.8 | 1.2 |
| 2.733185608623089 | 0.397 | 0.794 | 1.191 |
| 2.736327201276678 | 0.394 | 0.789 | 1.183 |
| 2.739468793930268 | 0.391 | 0.783 | 1.174 |
| 2.742610386583858 | 0.388 | 0.777 | 1.165 |
| 2.745751979237447 | 0.386 | 0.771 | 1.157 |
| 2.748893571891036 | 0.383 | 0.765 | 1.148 |
| 2.752035164544627 | 0.38 | 0.76 | 1.139 |
| 2.755176757198216 | 0.377 | 0.754 | 1.131 |
| 2.758318349851806 | 0.374 | 0.748 | 1.122 |
| 2.761459942505395 | 0.371 | 0.742 | 1.113 |
| 2.764601535158985 | 0.368 | 0.736 | 1.104 |
| 2.767743127812574 | 0.365 | 0.73 | 1.096 |
| 2.770884720466164 | 0.362 | 0.725 | 1.087 |
| 2.774026313119754 | 0.359 | 0.719 | 1.078 |
| 2.777167905773343 | 0.356 | 0.713 | 1.069 |
| 2.780309498426932 | 0.353 | 0.707 | 1.06 |
| 2.783451091080522 | 0.351 | 0.701 | 1.052 |
| 2.786592683734112 | 0.348 | 0.695 | 1.043 |
| 2.789734276387701 | 0.345 | 0.689 | 1.034 |
| 2.792875869041291 | 0.342 | 0.683 | 1.025 |
| 2.796017461694881 | 0.339 | 0.677 | 1.016 |
| 2.79915905434847 | 0.336 | 0.672 | 1.007 |
| 2.80230064700206 | 0.333 | 0.666 | 0.998 |
| 2.80544223965565 | 0.33 | 0.66 | 0.99 |
| 2.808583832309239 | 0.327 | 0.654 | 0.981 |
| 2.811725424962829 | 0.324 | 0.648 | 0.972 |
| 2.814867017616419 | 0.321 | 0.642 | 0.963 |
| 2.818008610270008 | 0.318 | 0.636 | 0.954 |
| 2.821150202923598 | 0.315 | 0.63 | 0.945 |
| 2.824291795577187 | 0.312 | 0.624 | 0.936 |
| 2.827433388230777 | 0.309 | 0.618 | 0.927 |
| 2.830574980884366 | 0.306 | 0.612 | 0.918 |
| 2.833716573537956 | 0.303 | 0.606 | 0.909 |
| 2.836858166191546 | 0.3 | 0.6 | 0.9 |
| 2.839999758845135 | 0.297 | 0.594 | 0.891 |
| 2.843141351498725 | 0.294 | 0.588 | 0.882 |
| 2.846282944152314 | 0.291 | 0.582 | 0.873 |
| 2.849424536805904 | 0.288 | 0.576 | 0.864 |
| 2.852566129459494 | 0.285 | 0.57 | 0.855 |
| 2.855707722113083 | 0.282 | 0.564 | 0.846 |
| 2.858849314766673 | 0.279 | 0.558 | 0.837 |
| 2.861990907420262 | 0.276 | 0.552 | 0.828 |
| 2.865132500073852 | 0.273 | 0.546 | 0.819 |
| 2.868274092727442 | 0.27 | 0.54 | 0.81 |
| 2.871415685381031 | 0.267 | 0.534 | 0.801 |
| 2.874557278034621 | 0.264 | 0.528 | 0.792 |
| 2.87769887068821 | 0.261 | 0.522 | 0.783 |
| 2.8808404633418 | 0.258 | 0.516 | 0.773 |
| 2.88398205599539 | 0.255 | 0.51 | 0.764 |
| 2.88712364864898 | 0.252 | 0.503 | 0.755 |
| 2.890265241302569 | 0.249 | 0.497 | 0.746 |
| 2.893406833956158 | 0.246 | 0.491 | 0.737 |
| 2.896548426609748 | 0.243 | 0.485 | 0.728 |
| 2.899690019263338 | 0.24 | 0.479 | 0.719 |
| 2.902831611916927 | 0.236 | 0.473 | 0.709 |
| 2.905973204570517 | 0.233 | 0.467 | 0.7 |
| 2.909114797224106 | 0.23 | 0.461 | 0.691 |
| 2.912256389877696 | 0.227 | 0.455 | 0.682 |
| 2.915397982531286 | 0.224 | 0.449 | 0.673 |
| 2.918539575184875 | 0.221 | 0.442 | 0.664 |
| 2.921681167838465 | 0.218 | 0.436 | 0.654 |
| 2.924822760492054 | 0.215 | 0.43 | 0.645 |
| 2.927964353145644 | 0.212 | 0.424 | 0.636 |
| 2.931105945799234 | 0.209 | 0.418 | 0.627 |
| 2.934247538452823 | 0.206 | 0.412 | 0.618 |
| 2.937389131106413 | 0.203 | 0.406 | 0.608 |
| 2.940530723760002 | 0.2 | 0.399 | 0.599 |
| 2.943672316413592 | 0.197 | 0.393 | 0.59 |
| 2.946813909067182 | 0.194 | 0.387 | 0.581 |
| 2.949955501720771 | 0.19 | 0.381 | 0.571 |
| 2.953097094374361 | 0.187 | 0.375 | 0.562 |
| 2.95623868702795 | 0.184 | 0.369 | 0.553 |
| 2.95938027968154 | 0.181 | 0.362 | 0.544 |
| 2.96252187233513 | 0.178 | 0.356 | 0.534 |
| 2.965663464988719 | 0.175 | 0.35 | 0.525 |
| 2.968805057642309 | 0.172 | 0.344 | 0.516 |
| 2.971946650295898 | 0.169 | 0.338 | 0.507 |
| 2.975088242949488 | 0.166 | 0.331 | 0.497 |
| 2.978229835603078 | 0.163 | 0.325 | 0.488 |
| 2.981371428256667 | 0.16 | 0.319 | 0.479 |
| 2.984513020910257 | 0.156 | 0.313 | 0.469 |
| 2.987654613563846 | 0.153 | 0.307 | 0.46 |
| 2.990796206217436 | 0.15 | 0.3 | 0.451 |
| 2.993937798871025 | 0.147 | 0.294 | 0.441 |
| 2.997079391524615 | 0.144 | 0.288 | 0.432 |
| 3.000220984178205 | 0.141 | 0.282 | 0.423 |
| 3.003362576831794 | 0.138 | 0.276 | 0.413 |
| 3.006504169485384 | 0.135 | 0.269 | 0.404 |
| 3.009645762138974 | 0.132 | 0.263 | 0.395 |
| 3.012787354792563 | 0.128 | 0.257 | 0.385 |
| 3.015928947446153 | 0.125 | 0.251 | 0.376 |
| 3.019070540099742 | 0.122 | 0.244 | 0.367 |
| 3.022212132753332 | 0.119 | 0.238 | 0.357 |
| 3.025353725406922 | 0.116 | 0.232 | 0.348 |
| 3.028495318060511 | 0.113 | 0.226 | 0.339 |
| 3.031636910714101 | 0.11 | 0.219 | 0.329 |
| 3.03477850336769 | 0.107 | 0.213 | 0.32 |
| 3.03792009602128 | 0.103 | 0.207 | 0.31 |
| 3.04106168867487 | 0.1 | 0.201 | 0.301 |
| 3.04420328132846 | 0.097 | 0.194 | 0.292 |
| 3.047344873982049 | 0.094 | 0.188 | 0.282 |
| 3.050486466635638 | 0.091 | 0.182 | 0.273 |
| 3.053628059289228 | 0.088 | 0.176 | 0.264 |
| 3.056769651942818 | 0.085 | 0.169 | 0.254 |
| 3.059911244596407 | 0.082 | 0.163 | 0.245 |
| 3.063052837249997 | 0.078 | 0.157 | 0.235 |
| 3.066194429903586 | 0.075 | 0.151 | 0.226 |
| 3.069336022557176 | 0.072 | 0.144 | 0.217 |
| 3.072477615210766 | 0.069 | 0.138 | 0.207 |
| 3.075619207864355 | 0.066 | 0.132 | 0.198 |
| 3.078760800517945 | 0.063 | 0.126 | 0.188 |
| 3.081902393171534 | 0.06 | 0.119 | 0.179 |
| 3.085043985825124 | 0.057 | 0.113 | 0.17 |
| 3.088185578478713 | 0.053 | 0.107 | 0.16 |
| 3.091327171132303 | 0.05 | 0.1 | 0.151 |
| 3.094468763785893 | 0.047 | 0.094 | 0.141 |
| 3.097610356439482 | 0.044 | 0.088 | 0.132 |
| 3.100751949093072 | 0.041 | 0.082 | 0.122 |
| 3.103893541746661 | 0.038 | 0.075 | 0.113 |
| 3.107035134400251 | 0.035 | 0.069 | 0.104 |
| 3.110176727053841 | 0.031 | 0.063 | 0.094 |
| 3.11331831970743 | 0.028 | 0.057 | 0.085 |
| 3.11645991236102 | 0.025 | 0.05 | 0.075 |
| 3.11960150501461 | 0.022 | 0.044 | 0.066 |
| 3.122743097668199 | 0.019 | 0.038 | 0.057 |
| 3.125884690321789 | 0.016 | 0.031 | 0.047 |
| 3.129026282975378 | 0.013 | 0.025 | 0.038 |
| 3.132167875628968 | 0.009 | 0.019 | 0.028 |
| 3.135309468282557 | 0.006 | 0.013 | 0.019 |
| 3.138451060936147 | 0.003 | 0.006 | 0.009 |
| 3.141592653589737 | 0 | 0 | 0 |
| 3.144734246243326 | 0.003 | 0.006 | 0.009 |
| 3.147875838896916 | 0.006 | 0.013 | 0.019 |
| 3.151017431550505 | 0.009 | 0.019 | 0.028 |
| 3.154159024204095 | 0.013 | 0.025 | 0.038 |
| 3.157300616857685 | 0.016 | 0.031 | 0.047 |
| 3.160442209511274 | 0.019 | 0.038 | 0.057 |
| 3.163583802164864 | 0.022 | 0.044 | 0.066 |
| 3.166725394818453 | 0.025 | 0.05 | 0.075 |
| 3.169866987472043 | 0.028 | 0.057 | 0.085 |
| 3.173008580125633 | 0.031 | 0.063 | 0.094 |
| 3.176150172779222 | 0.035 | 0.069 | 0.104 |
| 3.179291765432812 | 0.038 | 0.075 | 0.113 |
| 3.182433358086401 | 0.041 | 0.082 | 0.122 |
| 3.185574950739991 | 0.044 | 0.088 | 0.132 |
| 3.188716543393581 | 0.047 | 0.094 | 0.141 |
| 3.19185813604717 | 0.05 | 0.1 | 0.151 |
| 3.19499972870076 | 0.053 | 0.107 | 0.16 |
| 3.198141321354349 | 0.057 | 0.113 | 0.17 |
| 3.20128291400794 | 0.06 | 0.119 | 0.179 |
| 3.204424506661528 | 0.063 | 0.126 | 0.188 |
| 3.207566099315118 | 0.066 | 0.132 | 0.198 |
| 3.210707691968708 | 0.069 | 0.138 | 0.207 |
| 3.213849284622297 | 0.072 | 0.144 | 0.217 |
| 3.216990877275887 | 0.075 | 0.151 | 0.226 |
| 3.220132469929476 | 0.078 | 0.157 | 0.235 |
| 3.223274062583066 | 0.082 | 0.163 | 0.245 |
| 3.226415655236656 | 0.085 | 0.169 | 0.254 |
| 3.229557247890245 | 0.088 | 0.176 | 0.264 |
| 3.232698840543835 | 0.091 | 0.182 | 0.273 |
| 3.235840433197425 | 0.094 | 0.188 | 0.282 |
| 3.238982025851014 | 0.097 | 0.194 | 0.292 |
| 3.242123618504604 | 0.1 | 0.201 | 0.301 |
| 3.245265211158193 | 0.103 | 0.207 | 0.31 |
| 3.248406803811783 | 0.107 | 0.213 | 0.32 |
| 3.251548396465373 | 0.11 | 0.219 | 0.329 |
| 3.254689989118962 | 0.113 | 0.226 | 0.339 |
| 3.257831581772551 | 0.116 | 0.232 | 0.348 |
| 3.260973174426141 | 0.119 | 0.238 | 0.357 |
| 3.26411476707973 | 0.122 | 0.244 | 0.367 |
| 3.267256359733321 | 0.125 | 0.251 | 0.376 |
| 3.27039795238691 | 0.128 | 0.257 | 0.385 |
| 3.2735395450405 | 0.132 | 0.263 | 0.395 |
| 3.276681137694089 | 0.135 | 0.269 | 0.404 |
| 3.279822730347679 | 0.138 | 0.276 | 0.413 |
| 3.282964323001269 | 0.141 | 0.282 | 0.423 |
| 3.286105915654858 | 0.144 | 0.288 | 0.432 |
| 3.289247508308448 | 0.147 | 0.294 | 0.441 |
| 3.292389100962037 | 0.15 | 0.3 | 0.451 |
| 3.295530693615627 | 0.153 | 0.307 | 0.46 |
| 3.298672286269217 | 0.156 | 0.313 | 0.469 |
| 3.301813878922806 | 0.16 | 0.319 | 0.479 |
| 3.304955471576396 | 0.163 | 0.325 | 0.488 |
| 3.308097064229985 | 0.166 | 0.331 | 0.497 |
| 3.311238656883575 | 0.169 | 0.338 | 0.507 |
| 3.314380249537165 | 0.172 | 0.344 | 0.516 |
| 3.317521842190754 | 0.175 | 0.35 | 0.525 |
| 3.320663434844344 | 0.178 | 0.356 | 0.534 |
| 3.323805027497933 | 0.181 | 0.362 | 0.544 |
| 3.326946620151523 | 0.184 | 0.369 | 0.553 |
| 3.330088212805113 | 0.187 | 0.375 | 0.562 |
| 3.333229805458702 | 0.19 | 0.381 | 0.571 |
| 3.336371398112292 | 0.194 | 0.387 | 0.581 |
| 3.339512990765881 | 0.197 | 0.393 | 0.59 |
| 3.342654583419471 | 0.2 | 0.399 | 0.599 |
| 3.345796176073061 | 0.203 | 0.406 | 0.608 |
| 3.34893776872665 | 0.206 | 0.412 | 0.618 |
| 3.35207936138024 | 0.209 | 0.418 | 0.627 |
| 3.355220954033829 | 0.212 | 0.424 | 0.636 |
| 3.358362546687419 | 0.215 | 0.43 | 0.645 |
| 3.361504139341009 | 0.218 | 0.436 | 0.654 |
| 3.364645731994598 | 0.221 | 0.442 | 0.664 |
| 3.367787324648188 | 0.224 | 0.449 | 0.673 |
| 3.370928917301777 | 0.227 | 0.455 | 0.682 |
| 3.374070509955367 | 0.23 | 0.461 | 0.691 |
| 3.377212102608956 | 0.233 | 0.467 | 0.7 |
| 3.380353695262546 | 0.236 | 0.473 | 0.709 |
| 3.383495287916136 | 0.24 | 0.479 | 0.719 |
| 3.386636880569725 | 0.243 | 0.485 | 0.728 |
| 3.389778473223315 | 0.246 | 0.491 | 0.737 |
| 3.392920065876904 | 0.249 | 0.497 | 0.746 |
| 3.396061658530494 | 0.252 | 0.503 | 0.755 |
| 3.399203251184084 | 0.255 | 0.51 | 0.764 |
| 3.402344843837673 | 0.258 | 0.516 | 0.773 |
| 3.405486436491263 | 0.261 | 0.522 | 0.783 |
| 3.408628029144852 | 0.264 | 0.528 | 0.792 |
| 3.411769621798442 | 0.267 | 0.534 | 0.801 |
| 3.414911214452032 | 0.27 | 0.54 | 0.81 |
| 3.418052807105621 | 0.273 | 0.546 | 0.819 |
| 3.421194399759211 | 0.276 | 0.552 | 0.828 |
| 3.4243359924128 | 0.279 | 0.558 | 0.837 |
| 3.42747758506639 | 0.282 | 0.564 | 0.846 |
| 3.43061917771998 | 0.285 | 0.57 | 0.855 |
| 3.433760770373569 | 0.288 | 0.576 | 0.864 |
| 3.436902363027159 | 0.291 | 0.582 | 0.873 |
| 3.440043955680748 | 0.294 | 0.588 | 0.882 |
| 3.443185548334338 | 0.297 | 0.594 | 0.891 |
| 3.446327140987927 | 0.3 | 0.6 | 0.9 |
| 3.449468733641517 | 0.303 | 0.606 | 0.909 |
| 3.452610326295107 | 0.306 | 0.612 | 0.918 |
| 3.455751918948696 | 0.309 | 0.618 | 0.927 |
| 3.458893511602286 | 0.312 | 0.624 | 0.936 |
| 3.462035104255876 | 0.315 | 0.63 | 0.945 |
| 3.465176696909465 | 0.318 | 0.636 | 0.954 |
| 3.468318289563055 | 0.321 | 0.642 | 0.963 |
| 3.471459882216644 | 0.324 | 0.648 | 0.972 |
| 3.474601474870234 | 0.327 | 0.654 | 0.981 |
| 3.477743067523824 | 0.33 | 0.66 | 0.99 |
| 3.480884660177413 | 0.333 | 0.666 | 0.998 |
| 3.484026252831002 | 0.336 | 0.672 | 1.007 |
| 3.487167845484592 | 0.339 | 0.677 | 1.016 |
| 3.490309438138182 | 0.342 | 0.683 | 1.025 |
| 3.493451030791772 | 0.345 | 0.689 | 1.034 |
| 3.496592623445361 | 0.348 | 0.695 | 1.043 |
| 3.499734216098951 | 0.351 | 0.701 | 1.052 |
| 3.50287580875254 | 0.353 | 0.707 | 1.06 |
| 3.50601740140613 | 0.356 | 0.713 | 1.069 |
| 3.50915899405972 | 0.359 | 0.719 | 1.078 |
| 3.512300586713309 | 0.362 | 0.725 | 1.087 |
| 3.515442179366899 | 0.365 | 0.73 | 1.096 |
| 3.518583772020488 | 0.368 | 0.736 | 1.104 |
| 3.521725364674078 | 0.371 | 0.742 | 1.113 |
| 3.524866957327668 | 0.374 | 0.748 | 1.122 |
| 3.528008549981257 | 0.377 | 0.754 | 1.131 |
| 3.531150142634847 | 0.38 | 0.76 | 1.139 |
| 3.534291735288436 | 0.383 | 0.765 | 1.148 |
| 3.537433327942026 | 0.386 | 0.771 | 1.157 |
| 3.540574920595616 | 0.388 | 0.777 | 1.165 |
| 3.543716513249205 | 0.391 | 0.783 | 1.174 |
| 3.546858105902795 | 0.394 | 0.789 | 1.183 |
| 3.549999698556384 | 0.397 | 0.794 | 1.191 |
| 3.553141291209974 | 0.4 | 0.8 | 1.2 |
| 3.556282883863564 | 0.403 | 0.806 | 1.209 |
| 3.559424476517153 | 0.406 | 0.812 | 1.217 |
| 3.562566069170743 | 0.409 | 0.817 | 1.226 |
| 3.565707661824332 | 0.412 | 0.823 | 1.235 |
| 3.568849254477922 | 0.414 | 0.829 | 1.243 |
| 3.571990847131511 | 0.417 | 0.834 | 1.252 |
| 3.575132439785101 | 0.42 | 0.84 | 1.26 |
| 3.578274032438691 | 0.423 | 0.846 | 1.269 |
| 3.58141562509228 | 0.426 | 0.852 | 1.277 |
| 3.58455721774587 | 0.429 | 0.857 | 1.286 |
| 3.58769881039946 | 0.431 | 0.863 | 1.294 |
| 3.590840403053049 | 0.434 | 0.869 | 1.303 |
| 3.593981995706639 | 0.437 | 0.874 | 1.311 |
| 3.597123588360228 | 0.44 | 0.88 | 1.32 |
| 3.600265181013818 | 0.443 | 0.886 | 1.328 |
| 3.603406773667407 | 0.446 | 0.891 | 1.337 |
| 3.606548366320997 | 0.448 | 0.897 | 1.345 |
| 3.609689958974587 | 0.451 | 0.902 | 1.354 |
| 3.612831551628176 | 0.454 | 0.908 | 1.362 |
| 3.615973144281766 | 0.457 | 0.914 | 1.37 |
| 3.619114736935355 | 0.46 | 0.919 | 1.379 |
| 3.622256329588945 | 0.462 | 0.925 | 1.387 |
| 3.625397922242534 | 0.465 | 0.93 | 1.395 |
| 3.628539514896124 | 0.468 | 0.936 | 1.404 |
| 3.631681107549714 | 0.471 | 0.941 | 1.412 |
| 3.634822700203303 | 0.473 | 0.947 | 1.42 |
| 3.637964292856893 | 0.476 | 0.952 | 1.429 |
| 3.641105885510483 | 0.479 | 0.958 | 1.437 |
| 3.644247478164072 | 0.482 | 0.964 | 1.445 |
| 3.647389070817662 | 0.485 | 0.969 | 1.454 |
| 3.650530663471251 | 0.487 | 0.975 | 1.462 |
| 3.653672256124841 | 0.49 | 0.98 | 1.47 |
| 3.656813848778431 | 0.493 | 0.985 | 1.478 |
| 3.65995544143202 | 0.495 | 0.991 | 1.486 |
| 3.66309703408561 | 0.498 | 0.996 | 1.495 |
| 3.666238626739199 | 0.501 | 1.002 | 1.503 |
| 3.66938021939279 | 0.504 | 1.007 | 1.511 |
| 3.672521812046378 | 0.506 | 1.013 | 1.519 |
| 3.675663404699968 | 0.509 | 1.018 | 1.527 |
| 3.678804997353558 | 0.512 | 1.023 | 1.535 |
| 3.681946590007147 | 0.514 | 1.029 | 1.543 |
| 3.685088182660737 | 0.517 | 1.034 | 1.551 |
| 3.688229775314326 | 0.52 | 1.04 | 1.559 |
| 3.691371367967916 | 0.522 | 1.045 | 1.567 |
| 3.694512960621506 | 0.525 | 1.05 | 1.576 |
| 3.697654553275095 | 0.528 | 1.056 | 1.584 |
| 3.700796145928685 | 0.531 | 1.061 | 1.592 |
| 3.703937738582274 | 0.533 | 1.066 | 1.6 |
| 3.707079331235864 | 0.536 | 1.072 | 1.607 |
| 3.710220923889454 | 0.538 | 1.077 | 1.615 |
| 3.713362516543043 | 0.541 | 1.082 | 1.623 |
| 3.716504109196633 | 0.544 | 1.088 | 1.631 |
| 3.719645701850223 | 0.546 | 1.093 | 1.639 |
| 3.722787294503812 | 0.549 | 1.098 | 1.647 |
| 3.725928887157402 | 0.552 | 1.103 | 1.655 |
| 3.729070479810991 | 0.554 | 1.109 | 1.663 |
| 3.732212072464581 | 0.557 | 1.114 | 1.671 |
| 3.735353665118171 | 0.559 | 1.119 | 1.678 |
| 3.73849525777176 | 0.562 | 1.124 | 1.686 |
| 3.74163685042535 | 0.565 | 1.129 | 1.694 |
| 3.744778443078939 | 0.567 | 1.135 | 1.702 |
| 3.747920035732529 | 0.57 | 1.14 | 1.71 |
| 3.751061628386119 | 0.572 | 1.145 | 1.717 |
| 3.754203221039708 | 0.575 | 1.15 | 1.725 |
| 3.757344813693298 | 0.578 | 1.155 | 1.733 |
| 3.760486406346887 | 0.58 | 1.16 | 1.74 |
| 3.763627999000477 | 0.583 | 1.165 | 1.748 |
| 3.766769591654067 | 0.585 | 1.17 | 1.756 |
| 3.769911184307656 | 0.588 | 1.176 | 1.763 |
| 3.773052776961246 | 0.59 | 1.181 | 1.771 |
| 3.776194369614835 | 0.593 | 1.186 | 1.779 |
| 3.779335962268425 | 0.595 | 1.191 | 1.786 |
| 3.782477554922014 | 0.598 | 1.196 | 1.794 |
| 3.785619147575604 | 0.6 | 1.201 | 1.801 |
| 3.788760740229193 | 0.603 | 1.206 | 1.809 |
| 3.791902332882783 | 0.605 | 1.211 | 1.816 |
| 3.795043925536373 | 0.608 | 1.216 | 1.824 |
| 3.798185518189962 | 0.61 | 1.221 | 1.831 |
| 3.801327110843552 | 0.613 | 1.226 | 1.839 |
| 3.804468703497142 | 0.615 | 1.231 | 1.846 |
| 3.807610296150731 | 0.618 | 1.236 | 1.854 |
| 3.810751888804321 | 0.62 | 1.241 | 1.861 |
| 3.813893481457911 | 0.623 | 1.246 | 1.868 |
| 3.8170350741115 | 0.625 | 1.25 | 1.876 |
| 3.82017666676509 | 0.628 | 1.255 | 1.883 |
| 3.823318259418679 | 0.63 | 1.26 | 1.89 |
| 3.826459852072269 | 0.633 | 1.265 | 1.898 |
| 3.829601444725859 | 0.635 | 1.27 | 1.905 |
| 3.832743037379448 | 0.637 | 1.275 | 1.912 |
| 3.835884630033038 | 0.64 | 1.28 | 1.92 |
| 3.839026222686627 | 0.642 | 1.285 | 1.927 |
| 3.842167815340217 | 0.645 | 1.289 | 1.934 |
| 3.845309407993807 | 0.647 | 1.294 | 1.941 |
| 3.848451000647396 | 0.649 | 1.299 | 1.948 |
| 3.851592593300986 | 0.652 | 1.304 | 1.956 |
| 3.854734185954575 | 0.654 | 1.308 | 1.963 |
| 3.857875778608165 | 0.657 | 1.313 | 1.97 |
| 3.861017371261755 | 0.659 | 1.318 | 1.977 |
| 3.864158963915344 | 0.661 | 1.323 | 1.984 |
| 3.867300556568933 | 0.664 | 1.327 | 1.991 |
| 3.870442149222523 | 0.666 | 1.332 | 1.998 |
| 3.873583741876112 | 0.668 | 1.337 | 2.005 |
| 3.876725334529703 | 0.671 | 1.341 | 2.012 |
| 3.879866927183292 | 0.673 | 1.346 | 2.019 |
| 3.883008519836882 | 0.675 | 1.351 | 2.026 |
| 3.886150112490471 | 0.678 | 1.355 | 2.033 |
| 3.889291705144061 | 0.68 | 1.36 | 2.04 |
| 3.892433297797651 | 0.682 | 1.365 | 2.047 |
| 3.89557489045124 | 0.685 | 1.369 | 2.054 |
| 3.89871648310483 | 0.687 | 1.374 | 2.061 |
| 3.901858075758419 | 0.689 | 1.378 | 2.067 |
| 3.904999668412009 | 0.691 | 1.383 | 2.074 |
| 3.908141261065598 | 0.694 | 1.387 | 2.081 |
| 3.911282853719188 | 0.696 | 1.392 | 2.088 |
| 3.914424446372778 | 0.698 | 1.396 | 2.094 |
| 3.917566039026367 | 0.7 | 1.401 | 2.101 |
| 3.920707631679957 | 0.703 | 1.405 | 2.108 |
| 3.923849224333547 | 0.705 | 1.41 | 2.115 |
| 3.926990816987136 | 0.707 | 1.414 | 2.121 |
| 3.930132409640726 | 0.709 | 1.419 | 2.128 |
| 3.933274002294315 | 0.712 | 1.423 | 2.135 |
| 3.936415594947905 | 0.714 | 1.427 | 2.141 |
| 3.939557187601495 | 0.716 | 1.432 | 2.148 |
| 3.942698780255084 | 0.718 | 1.436 | 2.154 |
| 3.945840372908674 | 0.72 | 1.441 | 2.161 |
| 3.948981965562263 | 0.722 | 1.445 | 2.167 |
| 3.952123558215853 | 0.725 | 1.449 | 2.174 |
| 3.955265150869442 | 0.727 | 1.454 | 2.18 |
| 3.958406743523032 | 0.729 | 1.458 | 2.187 |
| 3.961548336176622 | 0.731 | 1.462 | 2.193 |
| 3.964689928830211 | 0.733 | 1.467 | 2.2 |
| 3.967831521483801 | 0.735 | 1.471 | 2.206 |
| 3.97097311413739 | 0.738 | 1.475 | 2.213 |
| 3.97411470679098 | 0.74 | 1.479 | 2.219 |
| 3.97725629944457 | 0.742 | 1.483 | 2.225 |
| 3.98039789209816 | 0.744 | 1.488 | 2.232 |
| 3.983539484751749 | 0.746 | 1.492 | 2.238 |
| 3.986681077405338 | 0.748 | 1.496 | 2.244 |
| 3.989822670058928 | 0.75 | 1.5 | 2.25 |
| 3.992964262712517 | 0.752 | 1.504 | 2.257 |
| 3.996105855366107 | 0.754 | 1.509 | 2.263 |
| 3.999247448019697 | 0.756 | 1.513 | 2.269 |
| 4.002389040673287 | 0.758 | 1.517 | 2.275 |
| 4.005530633326877 | 0.76 | 1.521 | 2.281 |
| 4.008672225980466 | 0.762 | 1.525 | 2.287 |
| 4.011813818634056 | 0.764 | 1.529 | 2.293 |
| 4.014955411287645 | 0.766 | 1.533 | 2.299 |
| 4.018097003941234 | 0.769 | 1.537 | 2.306 |
| 4.021238596594824 | 0.771 | 1.541 | 2.312 |
| 4.024380189248414 | 0.773 | 1.545 | 2.318 |
| 4.027521781902004 | 0.775 | 1.549 | 2.324 |
| 4.030663374555593 | 0.776 | 1.553 | 2.329 |
| 4.033804967209183 | 0.778 | 1.557 | 2.335 |
| 4.036946559862773 | 0.78 | 1.561 | 2.341 |
| 4.040088152516362 | 0.782 | 1.565 | 2.347 |
| 4.043229745169951 | 0.784 | 1.569 | 2.353 |
| 4.046371337823541 | 0.786 | 1.573 | 2.359 |
| 4.049512930477131 | 0.788 | 1.576 | 2.365 |
| 4.05265452313072 | 0.79 | 1.58 | 2.37 |
| 4.05579611578431 | 0.792 | 1.584 | 2.376 |
| 4.0589377084379 | 0.794 | 1.588 | 2.382 |
| 4.062079301091489 | 0.796 | 1.592 | 2.388 |
| 4.065220893745079 | 0.798 | 1.596 | 2.393 |
| 4.068362486398668 | 0.8 | 1.599 | 2.399 |
| 4.071504079052258 | 0.802 | 1.603 | 2.405 |
| 4.074645671705848 | 0.803 | 1.607 | 2.41 |
| 4.077787264359437 | 0.805 | 1.611 | 2.416 |
| 4.080928857013027 | 0.807 | 1.614 | 2.421 |
| 4.084070449666616 | 0.809 | 1.618 | 2.427 |
| 4.087212042320206 | 0.811 | 1.622 | 2.433 |
| 4.090353634973795 | 0.813 | 1.625 | 2.438 |
| 4.093495227627385 | 0.815 | 1.629 | 2.444 |
| 4.096636820280975 | 0.816 | 1.633 | 2.449 |
| 4.099778412934564 | 0.818 | 1.636 | 2.454 |
| 4.102920005588154 | 0.82 | 1.64 | 2.46 |
| 4.106061598241744 | 0.822 | 1.643 | 2.465 |
| 4.109203190895333 | 0.824 | 1.647 | 2.471 |
| 4.112344783548923 | 0.825 | 1.651 | 2.476 |
| 4.115486376202512 | 0.827 | 1.654 | 2.481 |
| 4.118627968856102 | 0.829 | 1.658 | 2.487 |
| 4.121769561509692 | 0.831 | 1.661 | 2.492 |
| 4.124911154163281 | 0.832 | 1.665 | 2.497 |
| 4.128052746816871 | 0.834 | 1.668 | 2.502 |
| 4.13119433947046 | 0.836 | 1.672 | 2.507 |
| 4.13433593212405 | 0.838 | 1.675 | 2.513 |
| 4.13747752477764 | 0.839 | 1.678 | 2.518 |
| 4.14061911743123 | 0.841 | 1.682 | 2.523 |
| 4.143760710084818 | 0.843 | 1.685 | 2.528 |
| 4.146902302738408 | 0.844 | 1.689 | 2.533 |
| 4.150043895391998 | 0.846 | 1.692 | 2.538 |
| 4.153185488045588 | 0.848 | 1.695 | 2.543 |
| 4.156327080699177 | 0.849 | 1.699 | 2.548 |
| 4.159468673352766 | 0.851 | 1.702 | 2.553 |
| 4.162610266006356 | 0.853 | 1.705 | 2.558 |
| 4.165751858659946 | 0.854 | 1.709 | 2.563 |
| 4.168893451313535 | 0.856 | 1.712 | 2.568 |
| 4.172035043967125 | 0.858 | 1.715 | 2.573 |
| 4.175176636620715 | 0.859 | 1.718 | 2.577 |
| 4.178318229274304 | 0.861 | 1.721 | 2.582 |
| 4.181459821927894 | 0.862 | 1.725 | 2.587 |
| 4.184601414581484 | 0.864 | 1.728 | 2.592 |
| 4.187743007235073 | 0.866 | 1.731 | 2.597 |
| 4.190884599888663 | 0.867 | 1.734 | 2.601 |
| 4.194026192542252 | 0.869 | 1.737 | 2.606 |
| 4.197167785195842 | 0.87 | 1.74 | 2.611 |
| 4.200309377849432 | 0.872 | 1.743 | 2.615 |
| 4.203450970503021 | 0.873 | 1.747 | 2.62 |
| 4.206592563156611 | 0.875 | 1.75 | 2.624 |
| 4.2097341558102 | 0.876 | 1.753 | 2.629 |
| 4.21287574846379 | 0.878 | 1.756 | 2.633 |
| 4.21601734111738 | 0.879 | 1.759 | 2.638 |
| 4.21915893377097 | 0.881 | 1.762 | 2.642 |
| 4.222300526424559 | 0.882 | 1.765 | 2.647 |
| 4.225442119078148 | 0.884 | 1.768 | 2.651 |
| 4.228583711731738 | 0.885 | 1.77 | 2.656 |
| 4.231725304385327 | 0.887 | 1.773 | 2.66 |
| 4.234866897038917 | 0.888 | 1.776 | 2.664 |
| 4.238008489692506 | 0.89 | 1.779 | 2.669 |
| 4.241150082346096 | 0.891 | 1.782 | 2.673 |
| 4.244291674999685 | 0.892 | 1.785 | 2.677 |
| 4.247433267653276 | 0.894 | 1.788 | 2.682 |
| 4.250574860306865 | 0.895 | 1.79 | 2.686 |
| 4.253716452960455 | 0.897 | 1.793 | 2.69 |
| 4.256858045614044 | 0.898 | 1.796 | 2.694 |
| 4.259999638267634 | 0.899 | 1.799 | 2.698 |
| 4.263141230921224 | 0.901 | 1.802 | 2.702 |
| 4.266282823574813 | 0.902 | 1.804 | 2.706 |
| 4.269424416228403 | 0.903 | 1.807 | 2.71 |
| 4.272566008881992 | 0.905 | 1.81 | 2.714 |
| 4.275707601535582 | 0.906 | 1.812 | 2.718 |
| 4.27884919418917 | 0.907 | 1.815 | 2.722 |
| 4.28199078684276 | 0.909 | 1.818 | 2.726 |
| 4.285132379496351 | 0.91 | 1.82 | 2.73 |
| 4.28827397214994 | 0.911 | 1.823 | 2.734 |
| 4.29141556480353 | 0.913 | 1.825 | 2.738 |
| 4.294557157457119 | 0.914 | 1.828 | 2.742 |
| 4.29769875011071 | 0.915 | 1.83 | 2.746 |
| 4.300840342764299 | 0.917 | 1.833 | 2.75 |
| 4.303981935417888 | 0.918 | 1.836 | 2.753 |
| 4.307123528071478 | 0.919 | 1.838 | 2.757 |
| 4.310265120725067 | 0.92 | 1.84 | 2.761 |
| 4.313406713378657 | 0.921 | 1.843 | 2.764 |
| 4.316548306032247 | 0.923 | 1.845 | 2.768 |
| 4.319689898685836 | 0.924 | 1.848 | 2.772 |
| 4.322831491339426 | 0.925 | 1.85 | 2.775 |
| 4.325973083993015 | 0.926 | 1.853 | 2.779 |
| 4.329114676646605 | 0.927 | 1.855 | 2.782 |
| 4.332256269300195 | 0.929 | 1.857 | 2.786 |
| 4.335397861953784 | 0.93 | 1.86 | 2.789 |
| 4.338539454607374 | 0.931 | 1.862 | 2.793 |
| 4.341681047260963 | 0.932 | 1.864 | 2.796 |
| 4.344822639914553 | 0.933 | 1.866 | 2.8 |
| 4.347964232568143 | 0.934 | 1.869 | 2.803 |
| 4.351105825221732 | 0.935 | 1.871 | 2.806 |
| 4.354247417875322 | 0.937 | 1.873 | 2.81 |
| 4.357389010528911 | 0.938 | 1.875 | 2.813 |
| 4.360530603182501 | 0.939 | 1.877 | 2.816 |
| 4.36367219583609 | 0.94 | 1.88 | 2.819 |
| 4.36681378848968 | 0.941 | 1.882 | 2.823 |
| 4.36995538114327 | 0.942 | 1.884 | 2.826 |
| 4.373096973796859 | 0.943 | 1.886 | 2.829 |
| 4.376238566450449 | 0.944 | 1.888 | 2.832 |
| 4.379380159104038 | 0.945 | 1.89 | 2.835 |
| 4.382521751757628 | 0.946 | 1.892 | 2.838 |
| 4.385663344411217 | 0.947 | 1.894 | 2.841 |
| 4.388804937064807 | 0.948 | 1.896 | 2.844 |
| 4.391946529718397 | 0.949 | 1.898 | 2.847 |
| 4.395088122371987 | 0.95 | 1.9 | 2.85 |
| 4.398229715025576 | 0.951 | 1.902 | 2.853 |
| 4.401371307679165 | 0.952 | 1.904 | 2.856 |
| 4.404512900332755 | 0.953 | 1.906 | 2.859 |
| 4.407654492986345 | 0.954 | 1.908 | 2.862 |
| 4.410796085639934 | 0.955 | 1.91 | 2.865 |
| 4.413937678293524 | 0.956 | 1.912 | 2.867 |
| 4.417079270947114 | 0.957 | 1.913 | 2.87 |
| 4.420220863600703 | 0.958 | 1.915 | 2.873 |
| 4.423362456254293 | 0.959 | 1.917 | 2.876 |
| 4.426504048907883 | 0.959 | 1.919 | 2.878 |
| 4.429645641561472 | 0.96 | 1.921 | 2.881 |
| 4.432787234215062 | 0.961 | 1.922 | 2.883 |
| 4.435928826868651 | 0.962 | 1.924 | 2.886 |
| 4.43907041952224 | 0.963 | 1.926 | 2.889 |
| 4.44221201217583 | 0.964 | 1.927 | 2.891 |
| 4.44535360482942 | 0.965 | 1.929 | 2.894 |
| 4.44849519748301 | 0.965 | 1.931 | 2.896 |
| 4.4516367901366 | 0.966 | 1.932 | 2.899 |
| 4.454778382790188 | 0.967 | 1.934 | 2.901 |
| 4.457919975443779 | 0.968 | 1.936 | 2.903 |
| 4.461061568097368 | 0.969 | 1.937 | 2.906 |
| 4.464203160750958 | 0.969 | 1.939 | 2.908 |
| 4.467344753404547 | 0.97 | 1.94 | 2.91 |
| 4.470486346058137 | 0.971 | 1.942 | 2.913 |
| 4.473627938711726 | 0.972 | 1.943 | 2.915 |
| 4.476769531365316 | 0.972 | 1.945 | 2.917 |
| 4.479911124018905 | 0.973 | 1.946 | 2.919 |
| 4.483052716672495 | 0.974 | 1.948 | 2.921 |
| 4.486194309326085 | 0.975 | 1.949 | 2.924 |
| 4.489335901979674 | 0.975 | 1.95 | 2.926 |
| 4.492477494633264 | 0.976 | 1.952 | 2.928 |
| 4.495619087286854 | 0.977 | 1.953 | 2.93 |
| 4.498760679940443 | 0.977 | 1.955 | 2.932 |
| 4.501902272594033 | 0.978 | 1.956 | 2.934 |
| 4.505043865247622 | 0.979 | 1.957 | 2.936 |
| 4.508185457901212 | 0.979 | 1.958 | 2.938 |
| 4.511327050554801 | 0.98 | 1.96 | 2.94 |
| 4.514468643208391 | 0.98 | 1.961 | 2.941 |
| 4.517610235861981 | 0.981 | 1.962 | 2.943 |
| 4.520751828515571 | 0.982 | 1.963 | 2.945 |
| 4.52389342116916 | 0.982 | 1.965 | 2.947 |
| 4.52703501382275 | 0.983 | 1.966 | 2.949 |
| 4.530176606476339 | 0.983 | 1.967 | 2.95 |
| 4.533318199129928 | 0.984 | 1.968 | 2.952 |
| 4.536459791783518 | 0.985 | 1.969 | 2.954 |
| 4.539601384437108 | 0.985 | 1.97 | 2.955 |
| 4.542742977090698 | 0.986 | 1.971 | 2.957 |
| 4.545884569744287 | 0.986 | 1.972 | 2.959 |
| 4.549026162397876 | 0.987 | 1.973 | 2.96 |
| 4.552167755051466 | 0.987 | 1.974 | 2.962 |
| 4.555309347705056 | 0.988 | 1.975 | 2.963 |
| 4.558450940358646 | 0.988 | 1.976 | 2.965 |
| 4.561592533012235 | 0.989 | 1.977 | 2.966 |
| 4.564734125665825 | 0.989 | 1.978 | 2.967 |
| 4.567875718319415 | 0.99 | 1.979 | 2.969 |
| 4.571017310973004 | 0.99 | 1.98 | 2.97 |
| 4.574158903626594 | 0.99 | 1.981 | 2.971 |
| 4.577300496280183 | 0.991 | 1.982 | 2.973 |
| 4.580442088933772 | 0.991 | 1.983 | 2.974 |
| 4.583583681587362 | 0.992 | 1.983 | 2.975 |
| 4.586725274240952 | 0.992 | 1.984 | 2.976 |
| 4.589866866894542 | 0.993 | 1.985 | 2.978 |
| 4.593008459548131 | 0.993 | 1.986 | 2.979 |
| 4.596150052201721 | 0.993 | 1.987 | 2.98 |
| 4.59929164485531 | 0.994 | 1.987 | 2.981 |
| 4.6024332375089 | 0.994 | 1.988 | 2.982 |
| 4.60557483016249 | 0.994 | 1.989 | 2.983 |
| 4.608716422816079 | 0.995 | 1.989 | 2.984 |
| 4.611858015469668 | 0.995 | 1.99 | 2.985 |
| 4.614999608123258 | 0.995 | 1.991 | 2.986 |
| 4.618141200776848 | 0.996 | 1.991 | 2.987 |
| 4.621282793430437 | 0.996 | 1.992 | 2.988 |
| 4.624424386084027 | 0.996 | 1.992 | 2.988 |
| 4.627565978737617 | 0.996 | 1.993 | 2.989 |
| 4.630707571391206 | 0.997 | 1.993 | 2.99 |
| 4.633849164044795 | 0.997 | 1.994 | 2.991 |
| 4.636990756698386 | 0.997 | 1.994 | 2.991 |
| 4.640132349351975 | 0.997 | 1.995 | 2.992 |
| 4.643273942005564 | 0.998 | 1.995 | 2.993 |
| 4.646415534659154 | 0.998 | 1.996 | 2.993 |
| 4.649557127312744 | 0.998 | 1.996 | 2.994 |
| 4.652698719966334 | 0.998 | 1.996 | 2.995 |
| 4.655840312619923 | 0.998 | 1.997 | 2.995 |
| 4.658981905273513 | 0.999 | 1.997 | 2.996 |
| 4.662123497927102 | 0.999 | 1.997 | 2.996 |
| 4.665265090580692 | 0.999 | 1.998 | 2.997 |
| 4.668406683234282 | 0.999 | 1.998 | 2.997 |
| 4.671548275887871 | 0.999 | 1.998 | 2.997 |
| 4.674689868541461 | 0.999 | 1.999 | 2.998 |
| 4.67783146119505 | 0.999 | 1.999 | 2.998 |
| 4.68097305384864 | 1 | 1.999 | 2.999 |
| 4.68411464650223 | 1 | 1.999 | 2.999 |
| 4.687256239155819 | 1 | 1.999 | 2.999 |
| 4.690397831809409 | 1 | 2 | 2.999 |
| 4.693539424462998 | 1 | 2 | 2.999 |
| 4.696681017116588 | 1 | 2 | 3 |
| 4.699822609770177 | 1 | 2 | 3 |
| 4.702964202423767 | 1 | 2 | 3 |
| 4.706105795077356 | 1 | 2 | 3 |
| 4.709247387730946 | 1 | 2 | 3 |
| 4.712388980384535 | 1 | 2 | 3 |
| 4.715530573038126 | 1 | 2 | 3 |
| 4.718672165691715 | 1 | 2 | 3 |
| 4.721813758345305 | 1 | 2 | 3 |
| 4.724955350998894 | 1 | 2 | 3 |
| 4.728096943652484 | 1 | 2 | 3 |
| 4.731238536306074 | 1 | 2 | 2.999 |
| 4.734380128959663 | 1 | 2 | 2.999 |
| 4.737521721613253 | 1 | 1.999 | 2.999 |
| 4.740663314266842 | 1 | 1.999 | 2.999 |
| 4.743804906920432 | 1 | 1.999 | 2.999 |
| 4.74694649957402 | 0.999 | 1.999 | 2.998 |
| 4.750088092227611 | 0.999 | 1.999 | 2.998 |
| 4.7532296848812 | 0.999 | 1.998 | 2.997 |
| 4.75637127753479 | 0.999 | 1.998 | 2.997 |
| 4.75951287018838 | 0.999 | 1.998 | 2.997 |
| 4.76265446284197 | 0.999 | 1.997 | 2.996 |
| 4.765796055495559 | 0.999 | 1.997 | 2.996 |
| 4.768937648149149 | 0.998 | 1.997 | 2.995 |
| 4.772079240802738 | 0.998 | 1.996 | 2.995 |
| 4.775220833456327 | 0.998 | 1.996 | 2.994 |
| 4.778362426109917 | 0.998 | 1.996 | 2.993 |
| 4.781504018763507 | 0.998 | 1.995 | 2.993 |
| 4.784645611417097 | 0.997 | 1.995 | 2.992 |
| 4.787787204070686 | 0.997 | 1.994 | 2.991 |
| 4.790928796724275 | 0.997 | 1.994 | 2.991 |
| 4.794070389377865 | 0.997 | 1.993 | 2.99 |
| 4.797211982031455 | 0.996 | 1.993 | 2.989 |
| 4.800353574685045 | 0.996 | 1.992 | 2.988 |
| 4.803495167338634 | 0.996 | 1.992 | 2.988 |
| 4.806636759992224 | 0.996 | 1.991 | 2.987 |
| 4.809778352645814 | 0.995 | 1.991 | 2.986 |
| 4.812919945299403 | 0.995 | 1.99 | 2.985 |
| 4.816061537952993 | 0.995 | 1.989 | 2.984 |
| 4.819203130606582 | 0.994 | 1.989 | 2.983 |
| 4.822344723260172 | 0.994 | 1.988 | 2.982 |
| 4.825486315913761 | 0.994 | 1.987 | 2.981 |
| 4.828627908567351 | 0.993 | 1.987 | 2.98 |
| 4.83176950122094 | 0.993 | 1.986 | 2.979 |
| 4.83491109387453 | 0.993 | 1.985 | 2.978 |
| 4.83805268652812 | 0.992 | 1.984 | 2.976 |
| 4.841194279181709 | 0.992 | 1.983 | 2.975 |
| 4.844335871835299 | 0.991 | 1.983 | 2.974 |
| 4.847477464488889 | 0.991 | 1.982 | 2.973 |
| 4.850619057142478 | 0.99 | 1.981 | 2.971 |
| 4.853760649796068 | 0.99 | 1.98 | 2.97 |
| 4.856902242449657 | 0.99 | 1.979 | 2.969 |
| 4.860043835103247 | 0.989 | 1.978 | 2.967 |
| 4.863185427756837 | 0.989 | 1.977 | 2.966 |
| 4.866327020410426 | 0.988 | 1.976 | 2.965 |
| 4.869468613064015 | 0.988 | 1.975 | 2.963 |
| 4.872610205717605 | 0.987 | 1.974 | 2.962 |
| 4.875751798371195 | 0.987 | 1.973 | 2.96 |
| 4.878893391024784 | 0.986 | 1.972 | 2.959 |
| 4.882034983678374 | 0.986 | 1.971 | 2.957 |
| 4.885176576331964 | 0.985 | 1.97 | 2.955 |
| 4.888318168985553 | 0.985 | 1.969 | 2.954 |
| 4.891459761639143 | 0.984 | 1.968 | 2.952 |
| 4.894601354292733 | 0.983 | 1.967 | 2.95 |
| 4.897742946946322 | 0.983 | 1.966 | 2.949 |
| 4.900884539599912 | 0.982 | 1.965 | 2.947 |
| 4.904026132253501 | 0.982 | 1.963 | 2.945 |
| 4.907167724907091 | 0.981 | 1.962 | 2.943 |
| 4.91030931756068 | 0.98 | 1.961 | 2.941 |
| 4.91345091021427 | 0.98 | 1.96 | 2.94 |
| 4.91659250286786 | 0.979 | 1.958 | 2.938 |
| 4.91973409552145 | 0.979 | 1.957 | 2.936 |
| 4.922875688175039 | 0.978 | 1.956 | 2.934 |
| 4.926017280828628 | 0.977 | 1.955 | 2.932 |
| 4.929158873482218 | 0.977 | 1.953 | 2.93 |
| 4.932300466135808 | 0.976 | 1.952 | 2.928 |
| 4.935442058789397 | 0.975 | 1.95 | 2.926 |
| 4.938583651442987 | 0.975 | 1.949 | 2.924 |
| 4.941725244096576 | 0.974 | 1.948 | 2.921 |
| 4.944866836750166 | 0.973 | 1.946 | 2.919 |
| 4.948008429403755 | 0.972 | 1.945 | 2.917 |
| 4.951150022057345 | 0.972 | 1.943 | 2.915 |
| 4.954291614710935 | 0.971 | 1.942 | 2.913 |
| 4.957433207364524 | 0.97 | 1.94 | 2.91 |
| 4.960574800018114 | 0.969 | 1.939 | 2.908 |
| 4.963716392671704 | 0.969 | 1.937 | 2.906 |
| 4.966857985325293 | 0.968 | 1.936 | 2.903 |
| 4.969999577978883 | 0.967 | 1.934 | 2.901 |
| 4.973141170632472 | 0.966 | 1.932 | 2.899 |
| 4.976282763286062 | 0.965 | 1.931 | 2.896 |
| 4.979424355939651 | 0.965 | 1.929 | 2.894 |
| 4.982565948593241 | 0.964 | 1.927 | 2.891 |
| 4.985707541246831 | 0.963 | 1.926 | 2.889 |
| 4.98884913390042 | 0.962 | 1.924 | 2.886 |
| 4.99199072655401 | 0.961 | 1.922 | 2.883 |
| 4.9951323192076 | 0.96 | 1.921 | 2.881 |
| 4.99827391186119 | 0.959 | 1.919 | 2.878 |
| 5.00141550451478 | 0.959 | 1.917 | 2.876 |
| 5.004557097168369 | 0.958 | 1.915 | 2.873 |
| 5.007698689821958 | 0.957 | 1.913 | 2.87 |
| 5.010840282475548 | 0.956 | 1.912 | 2.867 |
| 5.013981875129137 | 0.955 | 1.91 | 2.865 |
| 5.017123467782727 | 0.954 | 1.908 | 2.862 |
| 5.020265060436317 | 0.953 | 1.906 | 2.859 |
| 5.023406653089906 | 0.952 | 1.904 | 2.856 |
| 5.026548245743496 | 0.951 | 1.902 | 2.853 |
| 5.029689838397085 | 0.95 | 1.9 | 2.85 |
| 5.032831431050674 | 0.949 | 1.898 | 2.847 |
| 5.035973023704264 | 0.948 | 1.896 | 2.844 |
| 5.039114616357854 | 0.947 | 1.894 | 2.841 |
| 5.042256209011444 | 0.946 | 1.892 | 2.838 |
| 5.045397801665033 | 0.945 | 1.89 | 2.835 |
| 5.048539394318622 | 0.944 | 1.888 | 2.832 |
| 5.051680986972213 | 0.943 | 1.886 | 2.829 |
| 5.054822579625802 | 0.942 | 1.884 | 2.826 |
| 5.057964172279392 | 0.941 | 1.882 | 2.823 |
| 5.061105764932981 | 0.94 | 1.88 | 2.819 |
| 5.064247357586571 | 0.939 | 1.877 | 2.816 |
| 5.067388950240161 | 0.938 | 1.875 | 2.813 |
| 5.07053054289375 | 0.937 | 1.873 | 2.81 |
| 5.07367213554734 | 0.935 | 1.871 | 2.806 |
| 5.07681372820093 | 0.934 | 1.869 | 2.803 |
| 5.079955320854519 | 0.933 | 1.866 | 2.8 |
| 5.083096913508108 | 0.932 | 1.864 | 2.796 |
| 5.086238506161698 | 0.931 | 1.862 | 2.793 |
| 5.089380098815288 | 0.93 | 1.86 | 2.789 |
| 5.092521691468877 | 0.929 | 1.857 | 2.786 |
| 5.095663284122466 | 0.927 | 1.855 | 2.782 |
| 5.098804876776057 | 0.926 | 1.853 | 2.779 |
| 5.101946469429646 | 0.925 | 1.85 | 2.775 |
| 5.105088062083236 | 0.924 | 1.848 | 2.772 |
| 5.108229654736825 | 0.923 | 1.845 | 2.768 |
| 5.111371247390415 | 0.921 | 1.843 | 2.764 |
| 5.114512840044005 | 0.92 | 1.84 | 2.761 |
| 5.117654432697594 | 0.919 | 1.838 | 2.757 |
| 5.120796025351184 | 0.918 | 1.836 | 2.753 |
| 5.123937618004773 | 0.917 | 1.833 | 2.75 |
| 5.127079210658363 | 0.915 | 1.83 | 2.746 |
| 5.130220803311953 | 0.914 | 1.828 | 2.742 |
| 5.133362395965542 | 0.913 | 1.825 | 2.738 |
| 5.136503988619131 | 0.911 | 1.823 | 2.734 |
| 5.13964558127272 | 0.91 | 1.82 | 2.73 |
| 5.142787173926311 | 0.909 | 1.818 | 2.726 |
| 5.1459287665799 | 0.907 | 1.815 | 2.722 |
| 5.14907035923349 | 0.906 | 1.812 | 2.718 |
| 5.15221195188708 | 0.905 | 1.81 | 2.714 |
| 5.15535354454067 | 0.903 | 1.807 | 2.71 |
| 5.158495137194259 | 0.902 | 1.804 | 2.706 |
| 5.161636729847848 | 0.901 | 1.802 | 2.702 |
| 5.164778322501438 | 0.899 | 1.799 | 2.698 |
| 5.167919915155028 | 0.898 | 1.796 | 2.694 |
| 5.171061507808617 | 0.897 | 1.793 | 2.69 |
| 5.174203100462206 | 0.895 | 1.79 | 2.686 |
| 5.177344693115796 | 0.894 | 1.788 | 2.682 |
| 5.180486285769386 | 0.892 | 1.785 | 2.677 |
| 5.183627878422976 | 0.891 | 1.782 | 2.673 |
| 5.186769471076565 | 0.89 | 1.779 | 2.669 |
| 5.189911063730155 | 0.888 | 1.776 | 2.664 |
| 5.193052656383744 | 0.887 | 1.773 | 2.66 |
| 5.196194249037334 | 0.885 | 1.77 | 2.656 |
| 5.199335841690924 | 0.884 | 1.768 | 2.651 |
| 5.202477434344513 | 0.882 | 1.765 | 2.647 |
| 5.205619026998103 | 0.881 | 1.762 | 2.642 |
| 5.208760619651692 | 0.879 | 1.759 | 2.638 |
| 5.211902212305282 | 0.878 | 1.756 | 2.633 |
| 5.215043804958871 | 0.876 | 1.753 | 2.629 |
| 5.218185397612461 | 0.875 | 1.75 | 2.624 |
| 5.221326990266051 | 0.873 | 1.747 | 2.62 |
| 5.22446858291964 | 0.872 | 1.743 | 2.615 |
| 5.22761017557323 | 0.87 | 1.74 | 2.611 |
| 5.23075176822682 | 0.869 | 1.737 | 2.606 |
| 5.23389336088041 | 0.867 | 1.734 | 2.601 |
| 5.237034953533999 | 0.866 | 1.731 | 2.597 |
| 5.240176546187588 | 0.864 | 1.728 | 2.592 |
| 5.243318138841178 | 0.862 | 1.725 | 2.587 |
| 5.246459731494767 | 0.861 | 1.721 | 2.582 |
| 5.249601324148357 | 0.859 | 1.718 | 2.577 |
| 5.252742916801947 | 0.858 | 1.715 | 2.573 |
| 5.255884509455536 | 0.856 | 1.712 | 2.568 |
| 5.259026102109125 | 0.854 | 1.709 | 2.563 |
| 5.262167694762715 | 0.853 | 1.705 | 2.558 |
| 5.265309287416305 | 0.851 | 1.702 | 2.553 |
| 5.268450880069895 | 0.849 | 1.699 | 2.548 |
| 5.271592472723484 | 0.848 | 1.695 | 2.543 |
| 5.274734065377074 | 0.846 | 1.692 | 2.538 |
| 5.277875658030664 | 0.844 | 1.689 | 2.533 |
| 5.281017250684253 | 0.843 | 1.685 | 2.528 |
| 5.284158843337843 | 0.841 | 1.682 | 2.523 |
| 5.287300435991432 | 0.839 | 1.678 | 2.518 |
| 5.290442028645022 | 0.838 | 1.675 | 2.513 |
| 5.293583621298612 | 0.836 | 1.672 | 2.507 |
| 5.296725213952201 | 0.834 | 1.668 | 2.502 |
| 5.299866806605791 | 0.832 | 1.665 | 2.497 |
| 5.30300839925938 | 0.831 | 1.661 | 2.492 |
| 5.30614999191297 | 0.829 | 1.658 | 2.487 |
| 5.30929158456656 | 0.827 | 1.654 | 2.481 |
| 5.312433177220149 | 0.825 | 1.651 | 2.476 |
| 5.315574769873739 | 0.824 | 1.647 | 2.471 |
| 5.318716362527328 | 0.822 | 1.643 | 2.465 |
| 5.321857955180918 | 0.82 | 1.64 | 2.46 |
| 5.324999547834508 | 0.818 | 1.636 | 2.454 |
| 5.328141140488097 | 0.816 | 1.633 | 2.449 |
| 5.331282733141686 | 0.815 | 1.629 | 2.444 |
| 5.334424325795276 | 0.813 | 1.625 | 2.438 |
| 5.337565918448866 | 0.811 | 1.622 | 2.433 |
| 5.340707511102456 | 0.809 | 1.618 | 2.427 |
| 5.343849103756045 | 0.807 | 1.614 | 2.421 |
| 5.346990696409634 | 0.805 | 1.611 | 2.416 |
| 5.350132289063224 | 0.803 | 1.607 | 2.41 |
| 5.353273881716814 | 0.802 | 1.603 | 2.405 |
| 5.356415474370403 | 0.8 | 1.599 | 2.399 |
| 5.359557067023993 | 0.798 | 1.596 | 2.393 |
| 5.362698659677583 | 0.796 | 1.592 | 2.388 |
| 5.365840252331172 | 0.794 | 1.588 | 2.382 |
| 5.368981844984762 | 0.792 | 1.584 | 2.376 |
| 5.372123437638351 | 0.79 | 1.58 | 2.37 |
| 5.375265030291941 | 0.788 | 1.576 | 2.365 |
| 5.378406622945531 | 0.786 | 1.573 | 2.359 |
| 5.38154821559912 | 0.784 | 1.569 | 2.353 |
| 5.38468980825271 | 0.782 | 1.565 | 2.347 |
| 5.387831400906299 | 0.78 | 1.561 | 2.341 |
| 5.39097299355989 | 0.778 | 1.557 | 2.335 |
| 5.394114586213479 | 0.776 | 1.553 | 2.329 |
| 5.397256178867068 | 0.775 | 1.549 | 2.324 |
| 5.400397771520657 | 0.773 | 1.545 | 2.318 |
| 5.403539364174247 | 0.771 | 1.541 | 2.312 |
| 5.406680956827837 | 0.769 | 1.537 | 2.306 |
| 5.409822549481426 | 0.766 | 1.533 | 2.299 |
| 5.412964142135016 | 0.764 | 1.529 | 2.293 |
| 5.416105734788605 | 0.762 | 1.525 | 2.287 |
| 5.419247327442195 | 0.76 | 1.521 | 2.281 |
| 5.422388920095785 | 0.758 | 1.517 | 2.275 |
| 5.425530512749375 | 0.756 | 1.513 | 2.269 |
| 5.428672105402964 | 0.754 | 1.509 | 2.263 |
| 5.431813698056554 | 0.752 | 1.504 | 2.257 |
| 5.434955290710143 | 0.75 | 1.5 | 2.25 |
| 5.438096883363733 | 0.748 | 1.496 | 2.244 |
| 5.441238476017322 | 0.746 | 1.492 | 2.238 |
| 5.444380068670912 | 0.744 | 1.488 | 2.232 |
| 5.447521661324502 | 0.742 | 1.483 | 2.225 |
| 5.450663253978091 | 0.74 | 1.479 | 2.219 |
| 5.453804846631681 | 0.738 | 1.475 | 2.213 |
| 5.456946439285271 | 0.735 | 1.471 | 2.206 |
| 5.46008803193886 | 0.733 | 1.467 | 2.2 |
| 5.46322962459245 | 0.731 | 1.462 | 2.193 |
| 5.466371217246039 | 0.729 | 1.458 | 2.187 |
| 5.46951280989963 | 0.727 | 1.454 | 2.18 |
| 5.472654402553218 | 0.725 | 1.449 | 2.174 |
| 5.475795995206808 | 0.722 | 1.445 | 2.167 |
| 5.478937587860398 | 0.72 | 1.441 | 2.161 |
| 5.482079180513987 | 0.718 | 1.436 | 2.154 |
| 5.485220773167577 | 0.716 | 1.432 | 2.148 |
| 5.488362365821166 | 0.714 | 1.427 | 2.141 |
| 5.491503958474756 | 0.712 | 1.423 | 2.135 |
| 5.494645551128346 | 0.709 | 1.419 | 2.128 |
| 5.497787143781935 | 0.707 | 1.414 | 2.121 |
| 5.500928736435525 | 0.705 | 1.41 | 2.115 |
| 5.504070329089115 | 0.703 | 1.405 | 2.108 |
| 5.507211921742704 | 0.7 | 1.401 | 2.101 |
| 5.510353514396294 | 0.698 | 1.396 | 2.094 |
| 5.513495107049883 | 0.696 | 1.392 | 2.088 |
| 5.516636699703473 | 0.694 | 1.387 | 2.081 |
| 5.519778292357062 | 0.691 | 1.383 | 2.074 |
| 5.522919885010652 | 0.689 | 1.378 | 2.067 |
| 5.526061477664242 | 0.687 | 1.374 | 2.061 |
| 5.529203070317831 | 0.685 | 1.369 | 2.054 |
| 5.532344662971421 | 0.682 | 1.365 | 2.047 |
| 5.535486255625011 | 0.68 | 1.36 | 2.04 |
| 5.5386278482786 | 0.678 | 1.355 | 2.033 |
| 5.54176944093219 | 0.675 | 1.351 | 2.026 |
| 5.544911033585779 | 0.673 | 1.346 | 2.019 |
| 5.54805262623937 | 0.671 | 1.341 | 2.012 |
| 5.551194218892959 | 0.668 | 1.337 | 2.005 |
| 5.554335811546548 | 0.666 | 1.332 | 1.998 |
| 5.557477404200137 | 0.664 | 1.327 | 1.991 |
| 5.560618996853727 | 0.661 | 1.323 | 1.984 |
| 5.563760589507317 | 0.659 | 1.318 | 1.977 |
| 5.566902182160906 | 0.657 | 1.313 | 1.97 |
| 5.570043774814496 | 0.654 | 1.308 | 1.963 |
| 5.573185367468086 | 0.652 | 1.304 | 1.956 |
| 5.576326960121675 | 0.649 | 1.299 | 1.948 |
| 5.579468552775264 | 0.647 | 1.294 | 1.941 |
| 5.582610145428854 | 0.645 | 1.289 | 1.934 |
| 5.585751738082444 | 0.642 | 1.285 | 1.927 |
| 5.588893330736034 | 0.64 | 1.28 | 1.92 |
| 5.592034923389623 | 0.637 | 1.275 | 1.912 |
| 5.595176516043213 | 0.635 | 1.27 | 1.905 |
| 5.598318108696803 | 0.633 | 1.265 | 1.898 |
| 5.601459701350392 | 0.63 | 1.26 | 1.89 |
| 5.604601294003982 | 0.628 | 1.255 | 1.883 |
| 5.607742886657571 | 0.625 | 1.25 | 1.876 |
| 5.610884479311161 | 0.623 | 1.246 | 1.868 |
| 5.61402607196475 | 0.62 | 1.241 | 1.861 |
| 5.61716766461834 | 0.618 | 1.236 | 1.854 |
| 5.62030925727193 | 0.615 | 1.231 | 1.846 |
| 5.623450849925519 | 0.613 | 1.226 | 1.839 |
| 5.626592442579109 | 0.61 | 1.221 | 1.831 |
| 5.629734035232698 | 0.608 | 1.216 | 1.824 |
| 5.632875627886288 | 0.605 | 1.211 | 1.816 |
| 5.636017220539878 | 0.603 | 1.206 | 1.809 |
| 5.639158813193467 | 0.6 | 1.201 | 1.801 |
| 5.642300405847057 | 0.598 | 1.196 | 1.794 |
| 5.645441998500646 | 0.595 | 1.191 | 1.786 |
| 5.648583591154236 | 0.593 | 1.186 | 1.779 |
| 5.651725183807825 | 0.59 | 1.181 | 1.771 |
| 5.654866776461415 | 0.588 | 1.176 | 1.763 |
| 5.658008369115005 | 0.585 | 1.17 | 1.756 |
| 5.661149961768594 | 0.583 | 1.165 | 1.748 |
| 5.664291554422184 | 0.58 | 1.16 | 1.74 |
| 5.667433147075774 | 0.578 | 1.155 | 1.733 |
| 5.670574739729363 | 0.575 | 1.15 | 1.725 |
| 5.673716332382953 | 0.572 | 1.145 | 1.717 |
| 5.676857925036542 | 0.57 | 1.14 | 1.71 |
| 5.679999517690132 | 0.567 | 1.135 | 1.702 |
| 5.683141110343721 | 0.565 | 1.129 | 1.694 |
| 5.686282702997311 | 0.562 | 1.124 | 1.686 |
| 5.689424295650901 | 0.559 | 1.119 | 1.678 |
| 5.69256588830449 | 0.557 | 1.114 | 1.671 |
| 5.69570748095808 | 0.554 | 1.109 | 1.663 |
| 5.69884907361167 | 0.552 | 1.103 | 1.655 |
| 5.701990666265259 | 0.549 | 1.098 | 1.647 |
| 5.705132258918849 | 0.546 | 1.093 | 1.639 |
| 5.708273851572438 | 0.544 | 1.088 | 1.631 |
| 5.711415444226028 | 0.541 | 1.082 | 1.623 |
| 5.714557036879618 | 0.538 | 1.077 | 1.615 |
| 5.717698629533207 | 0.536 | 1.072 | 1.607 |
| 5.720840222186797 | 0.533 | 1.066 | 1.6 |
| 5.723981814840386 | 0.531 | 1.061 | 1.592 |
| 5.727123407493976 | 0.528 | 1.056 | 1.584 |
| 5.730265000147565 | 0.525 | 1.05 | 1.576 |
| 5.733406592801155 | 0.522 | 1.045 | 1.567 |
| 5.736548185454744 | 0.52 | 1.04 | 1.559 |
| 5.739689778108334 | 0.517 | 1.034 | 1.551 |
| 5.742831370761924 | 0.514 | 1.029 | 1.543 |
| 5.745972963415514 | 0.512 | 1.023 | 1.535 |
| 5.749114556069103 | 0.509 | 1.018 | 1.527 |
| 5.752256148722693 | 0.506 | 1.013 | 1.519 |
| 5.755397741376282 | 0.504 | 1.007 | 1.511 |
| 5.758539334029872 | 0.501 | 1.002 | 1.503 |
| 5.761680926683462 | 0.498 | 0.996 | 1.495 |
| 5.764822519337051 | 0.495 | 0.991 | 1.486 |
| 5.767964111990641 | 0.493 | 0.985 | 1.478 |
| 5.77110570464423 | 0.49 | 0.98 | 1.47 |
| 5.77424729729782 | 0.487 | 0.975 | 1.462 |
| 5.77738888995141 | 0.485 | 0.969 | 1.454 |
| 5.780530482605 | 0.482 | 0.964 | 1.445 |
| 5.783672075258588 | 0.479 | 0.958 | 1.437 |
| 5.786813667912178 | 0.476 | 0.952 | 1.429 |
| 5.789955260565768 | 0.473 | 0.947 | 1.42 |
| 5.793096853219358 | 0.471 | 0.941 | 1.412 |
| 5.796238445872947 | 0.468 | 0.936 | 1.404 |
| 5.799380038526537 | 0.465 | 0.93 | 1.395 |
| 5.802521631180126 | 0.462 | 0.925 | 1.387 |
| 5.805663223833715 | 0.46 | 0.919 | 1.379 |
| 5.808804816487306 | 0.457 | 0.914 | 1.37 |
| 5.811946409140895 | 0.454 | 0.908 | 1.362 |
| 5.815088001794485 | 0.451 | 0.902 | 1.354 |
| 5.818229594448074 | 0.448 | 0.897 | 1.345 |
| 5.821371187101663 | 0.446 | 0.891 | 1.337 |
| 5.824512779755254 | 0.443 | 0.886 | 1.328 |
| 5.827654372408843 | 0.44 | 0.88 | 1.32 |
| 5.830795965062433 | 0.437 | 0.874 | 1.311 |
| 5.833937557716022 | 0.434 | 0.869 | 1.303 |
| 5.837079150369612 | 0.431 | 0.863 | 1.294 |
| 5.840220743023201 | 0.429 | 0.857 | 1.286 |
| 5.843362335676791 | 0.426 | 0.852 | 1.277 |
| 5.846503928330381 | 0.423 | 0.846 | 1.269 |
| 5.84964552098397 | 0.42 | 0.84 | 1.26 |
| 5.85278711363756 | 0.417 | 0.834 | 1.252 |
| 5.85592870629115 | 0.414 | 0.829 | 1.243 |
| 5.85907029894474 | 0.412 | 0.823 | 1.235 |
| 5.862211891598329 | 0.409 | 0.817 | 1.226 |
| 5.865353484251918 | 0.406 | 0.812 | 1.217 |
| 5.868495076905508 | 0.403 | 0.806 | 1.209 |
| 5.871636669559098 | 0.4 | 0.8 | 1.2 |
| 5.874778262212687 | 0.397 | 0.794 | 1.191 |
| 5.877919854866277 | 0.394 | 0.789 | 1.183 |
| 5.881061447519866 | 0.391 | 0.783 | 1.174 |
| 5.884203040173456 | 0.388 | 0.777 | 1.165 |
| 5.887344632827046 | 0.386 | 0.771 | 1.157 |
| 5.890486225480635 | 0.383 | 0.765 | 1.148 |
| 5.893627818134224 | 0.38 | 0.76 | 1.139 |
| 5.896769410787814 | 0.377 | 0.754 | 1.131 |
| 5.899911003441404 | 0.374 | 0.748 | 1.122 |
| 5.903052596094994 | 0.371 | 0.742 | 1.113 |
| 5.906194188748583 | 0.368 | 0.736 | 1.104 |
| 5.909335781402172 | 0.365 | 0.73 | 1.096 |
| 5.912477374055762 | 0.362 | 0.725 | 1.087 |
| 5.915618966709352 | 0.359 | 0.719 | 1.078 |
| 5.918760559362942 | 0.356 | 0.713 | 1.069 |
| 5.921902152016531 | 0.353 | 0.707 | 1.06 |
| 5.92504374467012 | 0.351 | 0.701 | 1.052 |
| 5.92818533732371 | 0.348 | 0.695 | 1.043 |
| 5.9313269299773 | 0.345 | 0.689 | 1.034 |
| 5.93446852263089 | 0.342 | 0.683 | 1.025 |
| 5.93761011528448 | 0.339 | 0.677 | 1.016 |
| 5.940751707938068 | 0.336 | 0.672 | 1.007 |
| 5.943893300591658 | 0.333 | 0.666 | 0.998 |
| 5.947034893245248 | 0.33 | 0.66 | 0.99 |
| 5.950176485898837 | 0.327 | 0.654 | 0.981 |
| 5.953318078552427 | 0.324 | 0.648 | 0.972 |
| 5.956459671206017 | 0.321 | 0.642 | 0.963 |
| 5.959601263859606 | 0.318 | 0.636 | 0.954 |
| 5.962742856513196 | 0.315 | 0.63 | 0.945 |
| 5.965884449166785 | 0.312 | 0.624 | 0.936 |
| 5.969026041820375 | 0.309 | 0.618 | 0.927 |
| 5.972167634473964 | 0.306 | 0.612 | 0.918 |
| 5.975309227127554 | 0.303 | 0.606 | 0.909 |
| 5.978450819781144 | 0.3 | 0.6 | 0.9 |
| 5.981592412434733 | 0.297 | 0.594 | 0.891 |
| 5.984734005088323 | 0.294 | 0.588 | 0.882 |
| 5.987875597741913 | 0.291 | 0.582 | 0.873 |
| 5.991017190395502 | 0.288 | 0.576 | 0.864 |
| 5.994158783049092 | 0.285 | 0.57 | 0.855 |
| 5.997300375702681 | 0.282 | 0.564 | 0.846 |
| 6.000441968356271 | 0.279 | 0.558 | 0.837 |
| 6.003583561009861 | 0.276 | 0.552 | 0.828 |
| 6.00672515366345 | 0.273 | 0.546 | 0.819 |
| 6.00986674631704 | 0.27 | 0.54 | 0.81 |
| 6.01300833897063 | 0.267 | 0.534 | 0.801 |
| 6.01614993162422 | 0.264 | 0.528 | 0.792 |
| 6.019291524277808 | 0.261 | 0.522 | 0.783 |
| 6.022433116931398 | 0.258 | 0.516 | 0.773 |
| 6.025574709584988 | 0.255 | 0.51 | 0.764 |
| 6.028716302238577 | 0.252 | 0.503 | 0.755 |
| 6.031857894892167 | 0.249 | 0.497 | 0.746 |
| 6.034999487545757 | 0.246 | 0.491 | 0.737 |
| 6.038141080199346 | 0.243 | 0.485 | 0.728 |
| 6.041282672852935 | 0.24 | 0.479 | 0.719 |
| 6.044424265506525 | 0.236 | 0.473 | 0.709 |
| 6.047565858160115 | 0.233 | 0.467 | 0.7 |
| 6.050707450813704 | 0.23 | 0.461 | 0.691 |
| 6.053849043467294 | 0.227 | 0.455 | 0.682 |
| 6.056990636120884 | 0.224 | 0.449 | 0.673 |
| 6.060132228774473 | 0.221 | 0.442 | 0.664 |
| 6.063273821428063 | 0.218 | 0.436 | 0.654 |
| 6.066415414081653 | 0.215 | 0.43 | 0.645 |
| 6.069557006735242 | 0.212 | 0.424 | 0.636 |
| 6.072698599388831 | 0.209 | 0.418 | 0.627 |
| 6.07584019204242 | 0.206 | 0.412 | 0.618 |
| 6.078981784696011 | 0.203 | 0.406 | 0.608 |
| 6.082123377349601 | 0.2 | 0.399 | 0.599 |
| 6.08526497000319 | 0.197 | 0.393 | 0.59 |
| 6.08840656265678 | 0.194 | 0.387 | 0.581 |
| 6.09154815531037 | 0.19 | 0.381 | 0.571 |
| 6.094689747963959 | 0.187 | 0.375 | 0.562 |
| 6.097831340617549 | 0.184 | 0.369 | 0.553 |
| 6.100972933271138 | 0.181 | 0.362 | 0.544 |
| 6.104114525924728 | 0.178 | 0.356 | 0.534 |
| 6.107256118578317 | 0.175 | 0.35 | 0.525 |
| 6.110397711231907 | 0.172 | 0.344 | 0.516 |
| 6.113539303885497 | 0.169 | 0.338 | 0.507 |
| 6.116680896539086 | 0.166 | 0.331 | 0.497 |
| 6.119822489192675 | 0.163 | 0.325 | 0.488 |
| 6.122964081846265 | 0.16 | 0.319 | 0.479 |
| 6.126105674499855 | 0.156 | 0.313 | 0.469 |
| 6.129247267153445 | 0.153 | 0.307 | 0.46 |
| 6.132388859807034 | 0.15 | 0.3 | 0.451 |
| 6.135530452460624 | 0.147 | 0.294 | 0.441 |
| 6.138672045114213 | 0.144 | 0.288 | 0.432 |
| 6.141813637767803 | 0.141 | 0.282 | 0.423 |
| 6.144955230421393 | 0.138 | 0.276 | 0.413 |
| 6.148096823074982 | 0.135 | 0.269 | 0.404 |
| 6.151238415728571 | 0.132 | 0.263 | 0.395 |
| 6.154380008382161 | 0.128 | 0.257 | 0.385 |
| 6.157521601035751 | 0.125 | 0.251 | 0.376 |
| 6.16066319368934 | 0.122 | 0.244 | 0.367 |
| 6.16380478634293 | 0.119 | 0.238 | 0.357 |
| 6.16694637899652 | 0.116 | 0.232 | 0.348 |
| 6.170087971650109 | 0.113 | 0.226 | 0.339 |
| 6.173229564303698 | 0.11 | 0.219 | 0.329 |
| 6.176371156957289 | 0.107 | 0.213 | 0.32 |
| 6.179512749610878 | 0.103 | 0.207 | 0.31 |
| 6.182654342264468 | 0.1 | 0.201 | 0.301 |
| 6.185795934918057 | 0.097 | 0.194 | 0.292 |
| 6.188937527571647 | 0.094 | 0.188 | 0.282 |
| 6.192079120225237 | 0.091 | 0.182 | 0.273 |
| 6.195220712878826 | 0.088 | 0.176 | 0.264 |
| 6.198362305532415 | 0.085 | 0.169 | 0.254 |
| 6.201503898186005 | 0.082 | 0.163 | 0.245 |
| 6.204645490839594 | 0.078 | 0.157 | 0.235 |
| 6.207787083493184 | 0.075 | 0.151 | 0.226 |
| 6.210928676146774 | 0.072 | 0.144 | 0.217 |
| 6.214070268800364 | 0.069 | 0.138 | 0.207 |
| 6.217211861453953 | 0.066 | 0.132 | 0.198 |
| 6.220353454107543 | 0.063 | 0.126 | 0.188 |
| 6.223495046761133 | 0.06 | 0.119 | 0.179 |
| 6.226636639414722 | 0.057 | 0.113 | 0.17 |
| 6.229778232068312 | 0.053 | 0.107 | 0.16 |
| 6.232919824721901 | 0.05 | 0.1 | 0.151 |
| 6.236061417375491 | 0.047 | 0.094 | 0.141 |
| 6.23920301002908 | 0.044 | 0.088 | 0.132 |
| 6.24234460268267 | 0.041 | 0.082 | 0.122 |
| 6.24548619533626 | 0.038 | 0.075 | 0.113 |
| 6.24862778798985 | 0.035 | 0.069 | 0.104 |
| 6.251769380643438 | 0.031 | 0.063 | 0.094 |
| 6.254910973297028 | 0.028 | 0.057 | 0.085 |
| 6.258052565950618 | 0.025 | 0.05 | 0.075 |
| 6.261194158604208 | 0.022 | 0.044 | 0.066 |
| 6.264335751257797 | 0.019 | 0.038 | 0.057 |
| 6.267477343911387 | 0.016 | 0.031 | 0.047 |
| 6.270618936564976 | 0.013 | 0.025 | 0.038 |
| 6.273760529218566 | 0.009 | 0.019 | 0.028 |
| 6.276902121872155 | 0.006 | 0.013 | 0.019 |
| 6.280043714525745 | 0.003 | 0.006 | 0.009 |
| 6.283185307179335 | 0 | 0 | 0 |